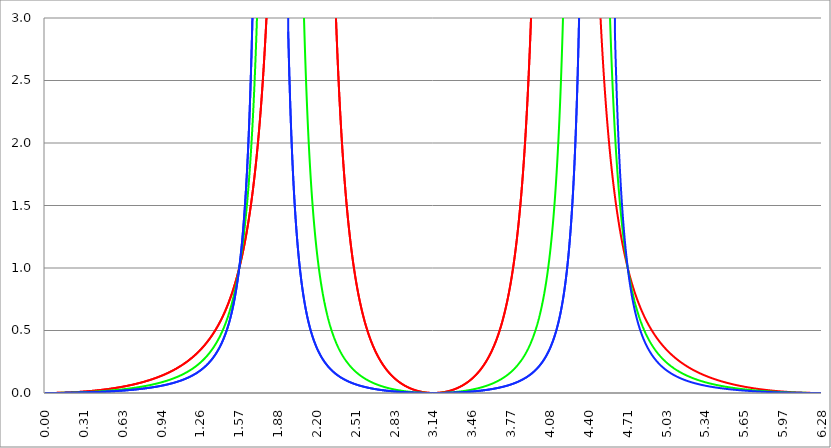
| Category | Series 1 | Series 0 | Series 2 |
|---|---|---|---|
| 0.0 | 0 | 0 | 0 |
| 0.00314159265358979 | 0 | 0 | 0 |
| 0.00628318530717958 | 0 | 0 | 0 |
| 0.00942477796076938 | 0 | 0 | 0 |
| 0.0125663706143592 | 0 | 0 | 0 |
| 0.015707963267949 | 0 | 0 | 0 |
| 0.0188495559215388 | 0 | 0 | 0 |
| 0.0219911485751285 | 0 | 0 | 0 |
| 0.0251327412287183 | 0 | 0 | 0 |
| 0.0282743338823081 | 0 | 0 | 0 |
| 0.0314159265358979 | 0 | 0 | 0 |
| 0.0345575191894877 | 0 | 0 | 0 |
| 0.0376991118430775 | 0 | 0 | 0 |
| 0.0408407044966673 | 0 | 0 | 0 |
| 0.0439822971502571 | 0 | 0 | 0 |
| 0.0471238898038469 | 0 | 0 | 0 |
| 0.0502654824574367 | 0 | 0 | 0 |
| 0.0534070751110265 | 0 | 0 | 0 |
| 0.0565486677646163 | 0 | 0 | 0 |
| 0.059690260418206 | 0 | 0 | 0 |
| 0.0628318530717958 | 0 | 0 | 0 |
| 0.0659734457253856 | 0 | 0 | 0 |
| 0.0691150383789754 | 0.001 | 0 | 0 |
| 0.0722566310325652 | 0.001 | 0 | 0 |
| 0.075398223686155 | 0.001 | 0 | 0 |
| 0.0785398163397448 | 0.001 | 0 | 0 |
| 0.0816814089933346 | 0.001 | 0 | 0 |
| 0.0848230016469244 | 0.001 | 0 | 0 |
| 0.0879645943005142 | 0.001 | 0 | 0 |
| 0.091106186954104 | 0.001 | 0.001 | 0 |
| 0.0942477796076937 | 0.001 | 0.001 | 0 |
| 0.0973893722612835 | 0.001 | 0.001 | 0 |
| 0.100530964914873 | 0.001 | 0.001 | 0 |
| 0.103672557568463 | 0.001 | 0.001 | 0 |
| 0.106814150222053 | 0.001 | 0.001 | 0 |
| 0.109955742875643 | 0.001 | 0.001 | 0 |
| 0.113097335529233 | 0.001 | 0.001 | 0.001 |
| 0.116238928182822 | 0.002 | 0.001 | 0.001 |
| 0.119380520836412 | 0.002 | 0.001 | 0.001 |
| 0.122522113490002 | 0.002 | 0.001 | 0.001 |
| 0.125663706143592 | 0.002 | 0.001 | 0.001 |
| 0.128805298797181 | 0.002 | 0.001 | 0.001 |
| 0.131946891450771 | 0.002 | 0.001 | 0.001 |
| 0.135088484104361 | 0.002 | 0.001 | 0.001 |
| 0.138230076757951 | 0.002 | 0.001 | 0.001 |
| 0.141371669411541 | 0.002 | 0.001 | 0.001 |
| 0.14451326206513 | 0.002 | 0.001 | 0.001 |
| 0.14765485471872 | 0.002 | 0.001 | 0.001 |
| 0.15079644737231 | 0.003 | 0.001 | 0.001 |
| 0.1539380400259 | 0.003 | 0.001 | 0.001 |
| 0.15707963267949 | 0.003 | 0.002 | 0.001 |
| 0.160221225333079 | 0.003 | 0.002 | 0.001 |
| 0.163362817986669 | 0.003 | 0.002 | 0.001 |
| 0.166504410640259 | 0.003 | 0.002 | 0.001 |
| 0.169646003293849 | 0.003 | 0.002 | 0.001 |
| 0.172787595947439 | 0.003 | 0.002 | 0.001 |
| 0.175929188601028 | 0.003 | 0.002 | 0.001 |
| 0.179070781254618 | 0.004 | 0.002 | 0.001 |
| 0.182212373908208 | 0.004 | 0.002 | 0.001 |
| 0.185353966561798 | 0.004 | 0.002 | 0.001 |
| 0.188495559215388 | 0.004 | 0.002 | 0.001 |
| 0.191637151868977 | 0.004 | 0.002 | 0.001 |
| 0.194778744522567 | 0.004 | 0.002 | 0.002 |
| 0.197920337176157 | 0.004 | 0.002 | 0.002 |
| 0.201061929829747 | 0.005 | 0.003 | 0.002 |
| 0.204203522483336 | 0.005 | 0.003 | 0.002 |
| 0.207345115136926 | 0.005 | 0.003 | 0.002 |
| 0.210486707790516 | 0.005 | 0.003 | 0.002 |
| 0.213628300444106 | 0.005 | 0.003 | 0.002 |
| 0.216769893097696 | 0.005 | 0.003 | 0.002 |
| 0.219911485751285 | 0.005 | 0.003 | 0.002 |
| 0.223053078404875 | 0.006 | 0.003 | 0.002 |
| 0.226194671058465 | 0.006 | 0.003 | 0.002 |
| 0.229336263712055 | 0.006 | 0.003 | 0.002 |
| 0.232477856365645 | 0.006 | 0.003 | 0.002 |
| 0.235619449019234 | 0.006 | 0.004 | 0.002 |
| 0.238761041672824 | 0.006 | 0.004 | 0.002 |
| 0.241902634326414 | 0.007 | 0.004 | 0.002 |
| 0.245044226980004 | 0.007 | 0.004 | 0.002 |
| 0.248185819633594 | 0.007 | 0.004 | 0.003 |
| 0.251327412287183 | 0.007 | 0.004 | 0.003 |
| 0.254469004940773 | 0.007 | 0.004 | 0.003 |
| 0.257610597594363 | 0.008 | 0.004 | 0.003 |
| 0.260752190247953 | 0.008 | 0.004 | 0.003 |
| 0.263893782901543 | 0.008 | 0.004 | 0.003 |
| 0.267035375555132 | 0.008 | 0.005 | 0.003 |
| 0.270176968208722 | 0.008 | 0.005 | 0.003 |
| 0.273318560862312 | 0.009 | 0.005 | 0.003 |
| 0.276460153515902 | 0.009 | 0.005 | 0.003 |
| 0.279601746169492 | 0.009 | 0.005 | 0.003 |
| 0.282743338823082 | 0.009 | 0.005 | 0.003 |
| 0.285884931476671 | 0.009 | 0.005 | 0.003 |
| 0.289026524130261 | 0.01 | 0.005 | 0.003 |
| 0.292168116783851 | 0.01 | 0.006 | 0.004 |
| 0.295309709437441 | 0.01 | 0.006 | 0.004 |
| 0.298451302091031 | 0.01 | 0.006 | 0.004 |
| 0.30159289474462 | 0.01 | 0.006 | 0.004 |
| 0.30473448739821 | 0.011 | 0.006 | 0.004 |
| 0.3078760800518 | 0.011 | 0.006 | 0.004 |
| 0.31101767270539 | 0.011 | 0.006 | 0.004 |
| 0.31415926535898 | 0.011 | 0.006 | 0.004 |
| 0.31730085801257 | 0.012 | 0.007 | 0.004 |
| 0.320442450666159 | 0.012 | 0.007 | 0.004 |
| 0.323584043319749 | 0.012 | 0.007 | 0.004 |
| 0.326725635973339 | 0.012 | 0.007 | 0.004 |
| 0.329867228626929 | 0.013 | 0.007 | 0.005 |
| 0.333008821280519 | 0.013 | 0.007 | 0.005 |
| 0.336150413934108 | 0.013 | 0.007 | 0.005 |
| 0.339292006587698 | 0.013 | 0.008 | 0.005 |
| 0.342433599241288 | 0.014 | 0.008 | 0.005 |
| 0.345575191894878 | 0.014 | 0.008 | 0.005 |
| 0.348716784548468 | 0.014 | 0.008 | 0.005 |
| 0.351858377202058 | 0.014 | 0.008 | 0.005 |
| 0.354999969855647 | 0.015 | 0.008 | 0.005 |
| 0.358141562509237 | 0.015 | 0.008 | 0.005 |
| 0.361283155162827 | 0.015 | 0.009 | 0.006 |
| 0.364424747816417 | 0.015 | 0.009 | 0.006 |
| 0.367566340470007 | 0.016 | 0.009 | 0.006 |
| 0.370707933123597 | 0.016 | 0.009 | 0.006 |
| 0.373849525777186 | 0.016 | 0.009 | 0.006 |
| 0.376991118430776 | 0.017 | 0.009 | 0.006 |
| 0.380132711084366 | 0.017 | 0.01 | 0.006 |
| 0.383274303737956 | 0.017 | 0.01 | 0.006 |
| 0.386415896391546 | 0.017 | 0.01 | 0.006 |
| 0.389557489045135 | 0.018 | 0.01 | 0.007 |
| 0.392699081698725 | 0.018 | 0.01 | 0.007 |
| 0.395840674352315 | 0.018 | 0.01 | 0.007 |
| 0.398982267005905 | 0.019 | 0.011 | 0.007 |
| 0.402123859659495 | 0.019 | 0.011 | 0.007 |
| 0.405265452313085 | 0.019 | 0.011 | 0.007 |
| 0.408407044966674 | 0.02 | 0.011 | 0.007 |
| 0.411548637620264 | 0.02 | 0.011 | 0.007 |
| 0.414690230273854 | 0.02 | 0.012 | 0.007 |
| 0.417831822927444 | 0.021 | 0.012 | 0.008 |
| 0.420973415581034 | 0.021 | 0.012 | 0.008 |
| 0.424115008234623 | 0.021 | 0.012 | 0.008 |
| 0.427256600888213 | 0.022 | 0.012 | 0.008 |
| 0.430398193541803 | 0.022 | 0.013 | 0.008 |
| 0.433539786195393 | 0.022 | 0.013 | 0.008 |
| 0.436681378848983 | 0.023 | 0.013 | 0.008 |
| 0.439822971502573 | 0.023 | 0.013 | 0.008 |
| 0.442964564156162 | 0.023 | 0.013 | 0.009 |
| 0.446106156809752 | 0.024 | 0.014 | 0.009 |
| 0.449247749463342 | 0.024 | 0.014 | 0.009 |
| 0.452389342116932 | 0.024 | 0.014 | 0.009 |
| 0.455530934770522 | 0.025 | 0.014 | 0.009 |
| 0.458672527424111 | 0.025 | 0.014 | 0.009 |
| 0.461814120077701 | 0.025 | 0.015 | 0.009 |
| 0.464955712731291 | 0.026 | 0.015 | 0.01 |
| 0.468097305384881 | 0.026 | 0.015 | 0.01 |
| 0.471238898038471 | 0.027 | 0.015 | 0.01 |
| 0.474380490692061 | 0.027 | 0.016 | 0.01 |
| 0.47752208334565 | 0.027 | 0.016 | 0.01 |
| 0.48066367599924 | 0.028 | 0.016 | 0.01 |
| 0.48380526865283 | 0.028 | 0.016 | 0.01 |
| 0.48694686130642 | 0.029 | 0.016 | 0.011 |
| 0.49008845396001 | 0.029 | 0.017 | 0.011 |
| 0.493230046613599 | 0.029 | 0.017 | 0.011 |
| 0.496371639267189 | 0.03 | 0.017 | 0.011 |
| 0.499513231920779 | 0.03 | 0.017 | 0.011 |
| 0.502654824574369 | 0.031 | 0.018 | 0.011 |
| 0.505796417227959 | 0.031 | 0.018 | 0.012 |
| 0.508938009881549 | 0.031 | 0.018 | 0.012 |
| 0.512079602535138 | 0.032 | 0.018 | 0.012 |
| 0.515221195188728 | 0.032 | 0.019 | 0.012 |
| 0.518362787842318 | 0.033 | 0.019 | 0.012 |
| 0.521504380495908 | 0.033 | 0.019 | 0.012 |
| 0.524645973149498 | 0.034 | 0.019 | 0.013 |
| 0.527787565803087 | 0.034 | 0.02 | 0.013 |
| 0.530929158456677 | 0.035 | 0.02 | 0.013 |
| 0.534070751110267 | 0.035 | 0.02 | 0.013 |
| 0.537212343763857 | 0.035 | 0.02 | 0.013 |
| 0.540353936417447 | 0.036 | 0.021 | 0.013 |
| 0.543495529071037 | 0.036 | 0.021 | 0.014 |
| 0.546637121724626 | 0.037 | 0.021 | 0.014 |
| 0.549778714378216 | 0.037 | 0.022 | 0.014 |
| 0.552920307031806 | 0.038 | 0.022 | 0.014 |
| 0.556061899685396 | 0.038 | 0.022 | 0.014 |
| 0.559203492338986 | 0.039 | 0.022 | 0.015 |
| 0.562345084992576 | 0.039 | 0.023 | 0.015 |
| 0.565486677646165 | 0.04 | 0.023 | 0.015 |
| 0.568628270299755 | 0.04 | 0.023 | 0.015 |
| 0.571769862953345 | 0.041 | 0.024 | 0.015 |
| 0.574911455606935 | 0.041 | 0.024 | 0.016 |
| 0.578053048260525 | 0.042 | 0.024 | 0.016 |
| 0.581194640914114 | 0.042 | 0.025 | 0.016 |
| 0.584336233567704 | 0.043 | 0.025 | 0.016 |
| 0.587477826221294 | 0.043 | 0.025 | 0.016 |
| 0.590619418874884 | 0.044 | 0.025 | 0.017 |
| 0.593761011528474 | 0.044 | 0.026 | 0.017 |
| 0.596902604182064 | 0.045 | 0.026 | 0.017 |
| 0.600044196835653 | 0.045 | 0.026 | 0.017 |
| 0.603185789489243 | 0.046 | 0.027 | 0.017 |
| 0.606327382142833 | 0.046 | 0.027 | 0.018 |
| 0.609468974796423 | 0.047 | 0.027 | 0.018 |
| 0.612610567450013 | 0.048 | 0.028 | 0.018 |
| 0.615752160103602 | 0.048 | 0.028 | 0.018 |
| 0.618893752757192 | 0.049 | 0.028 | 0.019 |
| 0.622035345410782 | 0.049 | 0.029 | 0.019 |
| 0.625176938064372 | 0.05 | 0.029 | 0.019 |
| 0.628318530717962 | 0.05 | 0.029 | 0.019 |
| 0.631460123371551 | 0.051 | 0.03 | 0.019 |
| 0.634601716025141 | 0.052 | 0.03 | 0.02 |
| 0.637743308678731 | 0.052 | 0.03 | 0.02 |
| 0.640884901332321 | 0.053 | 0.031 | 0.02 |
| 0.644026493985911 | 0.053 | 0.031 | 0.02 |
| 0.647168086639501 | 0.054 | 0.032 | 0.021 |
| 0.65030967929309 | 0.055 | 0.032 | 0.021 |
| 0.65345127194668 | 0.055 | 0.032 | 0.021 |
| 0.65659286460027 | 0.056 | 0.033 | 0.021 |
| 0.65973445725386 | 0.056 | 0.033 | 0.022 |
| 0.66287604990745 | 0.057 | 0.033 | 0.022 |
| 0.666017642561039 | 0.058 | 0.034 | 0.022 |
| 0.669159235214629 | 0.058 | 0.034 | 0.022 |
| 0.672300827868219 | 0.059 | 0.035 | 0.023 |
| 0.675442420521809 | 0.06 | 0.035 | 0.023 |
| 0.678584013175399 | 0.06 | 0.035 | 0.023 |
| 0.681725605828989 | 0.061 | 0.036 | 0.024 |
| 0.684867198482578 | 0.062 | 0.036 | 0.024 |
| 0.688008791136168 | 0.062 | 0.037 | 0.024 |
| 0.691150383789758 | 0.063 | 0.037 | 0.024 |
| 0.694291976443348 | 0.064 | 0.037 | 0.025 |
| 0.697433569096938 | 0.064 | 0.038 | 0.025 |
| 0.700575161750528 | 0.065 | 0.038 | 0.025 |
| 0.703716754404117 | 0.066 | 0.039 | 0.026 |
| 0.706858347057707 | 0.066 | 0.039 | 0.026 |
| 0.709999939711297 | 0.067 | 0.04 | 0.026 |
| 0.713141532364887 | 0.068 | 0.04 | 0.026 |
| 0.716283125018477 | 0.069 | 0.04 | 0.027 |
| 0.719424717672066 | 0.069 | 0.041 | 0.027 |
| 0.722566310325656 | 0.07 | 0.041 | 0.027 |
| 0.725707902979246 | 0.071 | 0.042 | 0.028 |
| 0.728849495632836 | 0.071 | 0.042 | 0.028 |
| 0.731991088286426 | 0.072 | 0.043 | 0.028 |
| 0.735132680940016 | 0.073 | 0.043 | 0.029 |
| 0.738274273593605 | 0.074 | 0.044 | 0.029 |
| 0.741415866247195 | 0.074 | 0.044 | 0.029 |
| 0.744557458900785 | 0.075 | 0.045 | 0.03 |
| 0.747699051554375 | 0.076 | 0.045 | 0.03 |
| 0.750840644207965 | 0.077 | 0.046 | 0.03 |
| 0.753982236861554 | 0.078 | 0.046 | 0.031 |
| 0.757123829515144 | 0.078 | 0.047 | 0.031 |
| 0.760265422168734 | 0.079 | 0.047 | 0.031 |
| 0.763407014822324 | 0.08 | 0.048 | 0.032 |
| 0.766548607475914 | 0.081 | 0.048 | 0.032 |
| 0.769690200129504 | 0.082 | 0.049 | 0.032 |
| 0.772831792783093 | 0.082 | 0.049 | 0.033 |
| 0.775973385436683 | 0.083 | 0.05 | 0.033 |
| 0.779114978090273 | 0.084 | 0.05 | 0.033 |
| 0.782256570743863 | 0.085 | 0.051 | 0.034 |
| 0.785398163397453 | 0.086 | 0.051 | 0.034 |
| 0.788539756051042 | 0.087 | 0.052 | 0.034 |
| 0.791681348704632 | 0.088 | 0.052 | 0.035 |
| 0.794822941358222 | 0.088 | 0.053 | 0.035 |
| 0.797964534011812 | 0.089 | 0.054 | 0.036 |
| 0.801106126665402 | 0.09 | 0.054 | 0.036 |
| 0.804247719318992 | 0.091 | 0.055 | 0.036 |
| 0.807389311972581 | 0.092 | 0.055 | 0.037 |
| 0.810530904626171 | 0.093 | 0.056 | 0.037 |
| 0.813672497279761 | 0.094 | 0.056 | 0.038 |
| 0.816814089933351 | 0.095 | 0.057 | 0.038 |
| 0.819955682586941 | 0.096 | 0.058 | 0.038 |
| 0.823097275240531 | 0.097 | 0.058 | 0.039 |
| 0.82623886789412 | 0.097 | 0.059 | 0.039 |
| 0.82938046054771 | 0.098 | 0.059 | 0.04 |
| 0.8325220532013 | 0.099 | 0.06 | 0.04 |
| 0.83566364585489 | 0.1 | 0.061 | 0.041 |
| 0.83880523850848 | 0.101 | 0.061 | 0.041 |
| 0.841946831162069 | 0.102 | 0.062 | 0.041 |
| 0.845088423815659 | 0.103 | 0.063 | 0.042 |
| 0.848230016469249 | 0.104 | 0.063 | 0.042 |
| 0.851371609122839 | 0.105 | 0.064 | 0.043 |
| 0.854513201776429 | 0.106 | 0.065 | 0.043 |
| 0.857654794430019 | 0.107 | 0.065 | 0.044 |
| 0.860796387083608 | 0.108 | 0.066 | 0.044 |
| 0.863937979737198 | 0.109 | 0.067 | 0.045 |
| 0.867079572390788 | 0.11 | 0.067 | 0.045 |
| 0.870221165044378 | 0.112 | 0.068 | 0.046 |
| 0.873362757697968 | 0.113 | 0.069 | 0.046 |
| 0.876504350351557 | 0.114 | 0.069 | 0.047 |
| 0.879645943005147 | 0.115 | 0.07 | 0.047 |
| 0.882787535658737 | 0.116 | 0.071 | 0.048 |
| 0.885929128312327 | 0.117 | 0.071 | 0.048 |
| 0.889070720965917 | 0.118 | 0.072 | 0.049 |
| 0.892212313619507 | 0.119 | 0.073 | 0.049 |
| 0.895353906273096 | 0.12 | 0.074 | 0.05 |
| 0.898495498926686 | 0.121 | 0.074 | 0.05 |
| 0.901637091580276 | 0.123 | 0.075 | 0.051 |
| 0.904778684233866 | 0.124 | 0.076 | 0.051 |
| 0.907920276887456 | 0.125 | 0.077 | 0.052 |
| 0.911061869541045 | 0.126 | 0.077 | 0.052 |
| 0.914203462194635 | 0.127 | 0.078 | 0.053 |
| 0.917345054848225 | 0.128 | 0.079 | 0.054 |
| 0.920486647501815 | 0.13 | 0.08 | 0.054 |
| 0.923628240155405 | 0.131 | 0.081 | 0.055 |
| 0.926769832808995 | 0.132 | 0.081 | 0.055 |
| 0.929911425462584 | 0.133 | 0.082 | 0.056 |
| 0.933053018116174 | 0.134 | 0.083 | 0.056 |
| 0.936194610769764 | 0.136 | 0.084 | 0.057 |
| 0.939336203423354 | 0.137 | 0.085 | 0.058 |
| 0.942477796076944 | 0.138 | 0.086 | 0.058 |
| 0.945619388730533 | 0.14 | 0.087 | 0.059 |
| 0.948760981384123 | 0.141 | 0.087 | 0.06 |
| 0.951902574037713 | 0.142 | 0.088 | 0.06 |
| 0.955044166691303 | 0.143 | 0.089 | 0.061 |
| 0.958185759344893 | 0.145 | 0.09 | 0.061 |
| 0.961327351998483 | 0.146 | 0.091 | 0.062 |
| 0.964468944652072 | 0.147 | 0.092 | 0.063 |
| 0.967610537305662 | 0.149 | 0.093 | 0.063 |
| 0.970752129959252 | 0.15 | 0.094 | 0.064 |
| 0.973893722612842 | 0.152 | 0.095 | 0.065 |
| 0.977035315266432 | 0.153 | 0.096 | 0.066 |
| 0.980176907920022 | 0.154 | 0.097 | 0.066 |
| 0.983318500573611 | 0.156 | 0.098 | 0.067 |
| 0.986460093227201 | 0.157 | 0.099 | 0.068 |
| 0.989601685880791 | 0.159 | 0.1 | 0.068 |
| 0.992743278534381 | 0.16 | 0.101 | 0.069 |
| 0.995884871187971 | 0.162 | 0.102 | 0.07 |
| 0.99902646384156 | 0.163 | 0.103 | 0.071 |
| 1.00216805649515 | 0.165 | 0.104 | 0.071 |
| 1.00530964914874 | 0.166 | 0.105 | 0.072 |
| 1.00845124180233 | 0.168 | 0.106 | 0.073 |
| 1.01159283445592 | 0.169 | 0.107 | 0.074 |
| 1.01473442710951 | 0.171 | 0.108 | 0.075 |
| 1.017876019763099 | 0.172 | 0.109 | 0.075 |
| 1.021017612416689 | 0.174 | 0.11 | 0.076 |
| 1.02415920507028 | 0.175 | 0.111 | 0.077 |
| 1.027300797723869 | 0.177 | 0.113 | 0.078 |
| 1.030442390377459 | 0.179 | 0.114 | 0.079 |
| 1.033583983031048 | 0.18 | 0.115 | 0.08 |
| 1.036725575684638 | 0.182 | 0.116 | 0.08 |
| 1.039867168338228 | 0.184 | 0.117 | 0.081 |
| 1.043008760991818 | 0.185 | 0.118 | 0.082 |
| 1.046150353645408 | 0.187 | 0.12 | 0.083 |
| 1.049291946298998 | 0.189 | 0.121 | 0.084 |
| 1.052433538952587 | 0.19 | 0.122 | 0.085 |
| 1.055575131606177 | 0.192 | 0.123 | 0.086 |
| 1.058716724259767 | 0.194 | 0.125 | 0.087 |
| 1.061858316913357 | 0.196 | 0.126 | 0.088 |
| 1.064999909566947 | 0.197 | 0.127 | 0.089 |
| 1.068141502220536 | 0.199 | 0.128 | 0.09 |
| 1.071283094874126 | 0.201 | 0.13 | 0.091 |
| 1.074424687527716 | 0.203 | 0.131 | 0.092 |
| 1.077566280181306 | 0.205 | 0.132 | 0.093 |
| 1.080707872834896 | 0.207 | 0.134 | 0.094 |
| 1.083849465488486 | 0.208 | 0.135 | 0.095 |
| 1.086991058142075 | 0.21 | 0.137 | 0.096 |
| 1.090132650795665 | 0.212 | 0.138 | 0.097 |
| 1.093274243449255 | 0.214 | 0.139 | 0.098 |
| 1.096415836102845 | 0.216 | 0.141 | 0.099 |
| 1.099557428756435 | 0.218 | 0.142 | 0.1 |
| 1.102699021410025 | 0.22 | 0.144 | 0.101 |
| 1.105840614063614 | 0.222 | 0.145 | 0.102 |
| 1.108982206717204 | 0.224 | 0.147 | 0.104 |
| 1.112123799370794 | 0.226 | 0.148 | 0.105 |
| 1.115265392024384 | 0.228 | 0.15 | 0.106 |
| 1.118406984677974 | 0.23 | 0.151 | 0.107 |
| 1.121548577331563 | 0.232 | 0.153 | 0.108 |
| 1.124690169985153 | 0.235 | 0.155 | 0.11 |
| 1.127831762638743 | 0.237 | 0.156 | 0.111 |
| 1.130973355292333 | 0.239 | 0.158 | 0.112 |
| 1.134114947945923 | 0.241 | 0.16 | 0.113 |
| 1.137256540599513 | 0.243 | 0.161 | 0.115 |
| 1.140398133253102 | 0.245 | 0.163 | 0.116 |
| 1.143539725906692 | 0.248 | 0.165 | 0.117 |
| 1.146681318560282 | 0.25 | 0.166 | 0.119 |
| 1.149822911213872 | 0.252 | 0.168 | 0.12 |
| 1.152964503867462 | 0.255 | 0.17 | 0.121 |
| 1.156106096521051 | 0.257 | 0.172 | 0.123 |
| 1.159247689174641 | 0.259 | 0.174 | 0.124 |
| 1.162389281828231 | 0.262 | 0.175 | 0.126 |
| 1.165530874481821 | 0.264 | 0.177 | 0.127 |
| 1.168672467135411 | 0.266 | 0.179 | 0.129 |
| 1.171814059789001 | 0.269 | 0.181 | 0.13 |
| 1.17495565244259 | 0.271 | 0.183 | 0.132 |
| 1.17809724509618 | 0.274 | 0.185 | 0.133 |
| 1.18123883774977 | 0.276 | 0.187 | 0.135 |
| 1.18438043040336 | 0.279 | 0.189 | 0.136 |
| 1.18752202305695 | 0.282 | 0.191 | 0.138 |
| 1.190663615710539 | 0.284 | 0.193 | 0.14 |
| 1.193805208364129 | 0.287 | 0.195 | 0.141 |
| 1.19694680101772 | 0.289 | 0.197 | 0.143 |
| 1.200088393671309 | 0.292 | 0.199 | 0.145 |
| 1.203229986324899 | 0.295 | 0.202 | 0.147 |
| 1.206371578978489 | 0.298 | 0.204 | 0.148 |
| 1.209513171632078 | 0.3 | 0.206 | 0.15 |
| 1.212654764285668 | 0.303 | 0.208 | 0.152 |
| 1.215796356939258 | 0.306 | 0.211 | 0.154 |
| 1.218937949592848 | 0.309 | 0.213 | 0.156 |
| 1.222079542246438 | 0.312 | 0.215 | 0.158 |
| 1.225221134900027 | 0.315 | 0.218 | 0.16 |
| 1.228362727553617 | 0.318 | 0.22 | 0.162 |
| 1.231504320207207 | 0.321 | 0.223 | 0.164 |
| 1.234645912860797 | 0.324 | 0.225 | 0.166 |
| 1.237787505514387 | 0.327 | 0.228 | 0.168 |
| 1.240929098167977 | 0.33 | 0.23 | 0.17 |
| 1.244070690821566 | 0.333 | 0.233 | 0.172 |
| 1.247212283475156 | 0.336 | 0.235 | 0.174 |
| 1.250353876128746 | 0.339 | 0.238 | 0.176 |
| 1.253495468782336 | 0.342 | 0.241 | 0.179 |
| 1.256637061435926 | 0.345 | 0.244 | 0.181 |
| 1.259778654089515 | 0.349 | 0.246 | 0.183 |
| 1.262920246743105 | 0.352 | 0.249 | 0.186 |
| 1.266061839396695 | 0.355 | 0.252 | 0.188 |
| 1.269203432050285 | 0.359 | 0.255 | 0.19 |
| 1.272345024703875 | 0.362 | 0.258 | 0.193 |
| 1.275486617357465 | 0.366 | 0.261 | 0.195 |
| 1.278628210011054 | 0.369 | 0.264 | 0.198 |
| 1.281769802664644 | 0.373 | 0.267 | 0.201 |
| 1.284911395318234 | 0.376 | 0.27 | 0.203 |
| 1.288052987971824 | 0.38 | 0.273 | 0.206 |
| 1.291194580625414 | 0.384 | 0.276 | 0.209 |
| 1.294336173279003 | 0.387 | 0.28 | 0.212 |
| 1.297477765932593 | 0.391 | 0.283 | 0.214 |
| 1.300619358586183 | 0.395 | 0.286 | 0.217 |
| 1.303760951239773 | 0.399 | 0.29 | 0.22 |
| 1.306902543893363 | 0.402 | 0.293 | 0.223 |
| 1.310044136546953 | 0.406 | 0.297 | 0.226 |
| 1.313185729200542 | 0.41 | 0.3 | 0.229 |
| 1.316327321854132 | 0.414 | 0.304 | 0.233 |
| 1.319468914507722 | 0.418 | 0.308 | 0.236 |
| 1.322610507161312 | 0.423 | 0.311 | 0.239 |
| 1.325752099814902 | 0.427 | 0.315 | 0.242 |
| 1.328893692468491 | 0.431 | 0.319 | 0.246 |
| 1.332035285122081 | 0.435 | 0.323 | 0.249 |
| 1.335176877775671 | 0.439 | 0.327 | 0.253 |
| 1.338318470429261 | 0.444 | 0.331 | 0.256 |
| 1.341460063082851 | 0.448 | 0.335 | 0.26 |
| 1.344601655736441 | 0.453 | 0.339 | 0.264 |
| 1.34774324839003 | 0.457 | 0.344 | 0.268 |
| 1.35088484104362 | 0.462 | 0.348 | 0.272 |
| 1.35402643369721 | 0.466 | 0.352 | 0.276 |
| 1.3571680263508 | 0.471 | 0.357 | 0.28 |
| 1.36030961900439 | 0.476 | 0.361 | 0.284 |
| 1.363451211657979 | 0.48 | 0.366 | 0.288 |
| 1.36659280431157 | 0.485 | 0.371 | 0.292 |
| 1.369734396965159 | 0.49 | 0.375 | 0.297 |
| 1.372875989618749 | 0.495 | 0.38 | 0.301 |
| 1.376017582272339 | 0.5 | 0.385 | 0.306 |
| 1.379159174925929 | 0.505 | 0.39 | 0.31 |
| 1.382300767579518 | 0.511 | 0.395 | 0.315 |
| 1.385442360233108 | 0.516 | 0.401 | 0.32 |
| 1.388583952886698 | 0.521 | 0.406 | 0.325 |
| 1.391725545540288 | 0.526 | 0.411 | 0.33 |
| 1.394867138193878 | 0.532 | 0.417 | 0.335 |
| 1.398008730847468 | 0.537 | 0.422 | 0.341 |
| 1.401150323501057 | 0.543 | 0.428 | 0.346 |
| 1.404291916154647 | 0.549 | 0.434 | 0.352 |
| 1.407433508808237 | 0.554 | 0.44 | 0.357 |
| 1.410575101461827 | 0.56 | 0.446 | 0.363 |
| 1.413716694115417 | 0.566 | 0.452 | 0.369 |
| 1.416858286769006 | 0.572 | 0.458 | 0.375 |
| 1.419999879422596 | 0.578 | 0.464 | 0.381 |
| 1.423141472076186 | 0.584 | 0.471 | 0.388 |
| 1.426283064729776 | 0.59 | 0.478 | 0.394 |
| 1.429424657383366 | 0.597 | 0.484 | 0.401 |
| 1.432566250036956 | 0.603 | 0.491 | 0.408 |
| 1.435707842690545 | 0.609 | 0.498 | 0.415 |
| 1.438849435344135 | 0.616 | 0.505 | 0.422 |
| 1.441991027997725 | 0.623 | 0.512 | 0.429 |
| 1.445132620651315 | 0.629 | 0.52 | 0.437 |
| 1.448274213304905 | 0.636 | 0.527 | 0.444 |
| 1.451415805958494 | 0.643 | 0.535 | 0.452 |
| 1.454557398612084 | 0.65 | 0.543 | 0.46 |
| 1.457698991265674 | 0.657 | 0.551 | 0.469 |
| 1.460840583919264 | 0.664 | 0.559 | 0.477 |
| 1.463982176572854 | 0.672 | 0.568 | 0.486 |
| 1.467123769226444 | 0.679 | 0.576 | 0.495 |
| 1.470265361880033 | 0.687 | 0.585 | 0.504 |
| 1.473406954533623 | 0.694 | 0.594 | 0.513 |
| 1.476548547187213 | 0.702 | 0.603 | 0.523 |
| 1.479690139840803 | 0.71 | 0.612 | 0.533 |
| 1.482831732494393 | 0.718 | 0.622 | 0.543 |
| 1.485973325147982 | 0.726 | 0.631 | 0.554 |
| 1.489114917801572 | 0.734 | 0.641 | 0.565 |
| 1.492256510455162 | 0.743 | 0.651 | 0.576 |
| 1.495398103108752 | 0.751 | 0.662 | 0.587 |
| 1.498539695762342 | 0.76 | 0.672 | 0.599 |
| 1.501681288415932 | 0.768 | 0.683 | 0.611 |
| 1.504822881069521 | 0.777 | 0.694 | 0.623 |
| 1.507964473723111 | 0.786 | 0.705 | 0.636 |
| 1.511106066376701 | 0.795 | 0.717 | 0.649 |
| 1.514247659030291 | 0.805 | 0.729 | 0.663 |
| 1.517389251683881 | 0.814 | 0.741 | 0.677 |
| 1.520530844337471 | 0.824 | 0.753 | 0.692 |
| 1.52367243699106 | 0.833 | 0.766 | 0.706 |
| 1.52681402964465 | 0.843 | 0.779 | 0.722 |
| 1.52995562229824 | 0.853 | 0.792 | 0.738 |
| 1.53309721495183 | 0.863 | 0.806 | 0.754 |
| 1.53623880760542 | 0.874 | 0.82 | 0.771 |
| 1.539380400259009 | 0.884 | 0.834 | 0.788 |
| 1.542521992912599 | 0.895 | 0.849 | 0.806 |
| 1.545663585566189 | 0.906 | 0.864 | 0.825 |
| 1.548805178219779 | 0.917 | 0.88 | 0.844 |
| 1.551946770873369 | 0.928 | 0.896 | 0.864 |
| 1.555088363526959 | 0.94 | 0.912 | 0.885 |
| 1.558229956180548 | 0.951 | 0.929 | 0.906 |
| 1.561371548834138 | 0.963 | 0.946 | 0.929 |
| 1.564513141487728 | 0.975 | 0.963 | 0.952 |
| 1.567654734141318 | 0.988 | 0.981 | 0.975 |
| 1.570796326794908 | 1 | 1 | 1 |
| 1.573937919448497 | 1.013 | 1.019 | 1.026 |
| 1.577079512102087 | 1.026 | 1.039 | 1.052 |
| 1.580221104755677 | 1.039 | 1.059 | 1.08 |
| 1.583362697409267 | 1.052 | 1.08 | 1.108 |
| 1.586504290062857 | 1.066 | 1.101 | 1.138 |
| 1.589645882716447 | 1.079 | 1.123 | 1.169 |
| 1.592787475370036 | 1.094 | 1.146 | 1.202 |
| 1.595929068023626 | 1.108 | 1.169 | 1.235 |
| 1.599070660677216 | 1.123 | 1.193 | 1.27 |
| 1.602212253330806 | 1.137 | 1.218 | 1.307 |
| 1.605353845984396 | 1.153 | 1.243 | 1.345 |
| 1.608495438637985 | 1.168 | 1.269 | 1.385 |
| 1.611637031291575 | 1.184 | 1.296 | 1.426 |
| 1.614778623945165 | 1.2 | 1.324 | 1.47 |
| 1.617920216598755 | 1.216 | 1.353 | 1.515 |
| 1.621061809252345 | 1.233 | 1.383 | 1.562 |
| 1.624203401905935 | 1.25 | 1.414 | 1.612 |
| 1.627344994559524 | 1.267 | 1.445 | 1.664 |
| 1.630486587213114 | 1.285 | 1.478 | 1.719 |
| 1.633628179866704 | 1.303 | 1.512 | 1.776 |
| 1.636769772520294 | 1.321 | 1.547 | 1.837 |
| 1.639911365173884 | 1.34 | 1.583 | 1.9 |
| 1.643052957827473 | 1.359 | 1.621 | 1.967 |
| 1.646194550481063 | 1.378 | 1.66 | 2.037 |
| 1.649336143134653 | 1.398 | 1.7 | 2.111 |
| 1.652477735788243 | 1.419 | 1.742 | 2.189 |
| 1.655619328441833 | 1.439 | 1.785 | 2.272 |
| 1.658760921095423 | 1.46 | 1.83 | 2.359 |
| 1.661902513749012 | 1.482 | 1.876 | 2.451 |
| 1.665044106402602 | 1.504 | 1.924 | 2.549 |
| 1.668185699056192 | 1.527 | 1.974 | 2.653 |
| 1.671327291709782 | 1.55 | 2.027 | 2.763 |
| 1.674468884363372 | 1.573 | 2.081 | 2.88 |
| 1.677610477016961 | 1.597 | 2.137 | 3.005 |
| 1.680752069670551 | 1.622 | 2.196 | 3.138 |
| 1.683893662324141 | 1.647 | 2.257 | 3.281 |
| 1.687035254977731 | 1.672 | 2.32 | 3.433 |
| 1.690176847631321 | 1.699 | 2.387 | 3.596 |
| 1.693318440284911 | 1.726 | 2.456 | 3.77 |
| 1.6964600329385 | 1.753 | 2.528 | 3.958 |
| 1.69960162559209 | 1.781 | 2.603 | 4.16 |
| 1.70274321824568 | 1.81 | 2.682 | 4.379 |
| 1.70588481089927 | 1.839 | 2.764 | 4.614 |
| 1.70902640355286 | 1.869 | 2.851 | 4.87 |
| 1.712167996206449 | 1.9 | 2.941 | 5.147 |
| 1.715309588860039 | 1.932 | 3.036 | 5.448 |
| 1.71845118151363 | 1.964 | 3.135 | 5.777 |
| 1.721592774167219 | 1.997 | 3.239 | 6.137 |
| 1.724734366820809 | 2.031 | 3.349 | 6.531 |
| 1.727875959474399 | 2.066 | 3.464 | 6.964 |
| 1.731017552127988 | 2.102 | 3.585 | 7.443 |
| 1.734159144781578 | 2.138 | 3.713 | 7.972 |
| 1.737300737435168 | 2.176 | 3.847 | 8.561 |
| 1.740442330088758 | 2.215 | 3.989 | 9.217 |
| 1.743583922742348 | 2.254 | 4.139 | 9.951 |
| 1.746725515395937 | 2.295 | 4.298 | 10.777 |
| 1.749867108049527 | 2.336 | 4.466 | 11.711 |
| 1.753008700703117 | 2.379 | 4.643 | 12.773 |
| 1.756150293356707 | 2.423 | 4.832 | 13.985 |
| 1.759291886010297 | 2.468 | 5.033 | 15.38 |
| 1.762433478663887 | 2.515 | 5.246 | 16.994 |
| 1.765575071317476 | 2.562 | 5.473 | 18.878 |
| 1.768716663971066 | 2.611 | 5.716 | 21.095 |
| 1.771858256624656 | 2.662 | 5.975 | 23.727 |
| 1.774999849278246 | 2.714 | 6.252 | 26.886 |
| 1.778141441931836 | 2.767 | 6.548 | 30.723 |
| 1.781283034585426 | 2.822 | 6.867 | 35.446 |
| 1.784424627239015 | 2.879 | 7.209 | 41.353 |
| 1.787566219892605 | 2.937 | 7.578 | 48.873 |
| 1.790707812546195 | 2.997 | 7.975 | 58.655 |
| 1.793849405199785 | 3.059 | 8.405 | 71.705 |
| 1.796990997853375 | 3.123 | 8.871 | 89.663 |
| 1.800132590506964 | 3.189 | 9.377 | 115.34 |
| 1.803274183160554 | 3.257 | 9.928 | 153.891 |
| 1.806415775814144 | 3.327 | 10.529 | 215.627 |
| 1.809557368467734 | 3.399 | 11.187 | 323.706 |
| 1.812698961121324 | 3.474 | 11.908 | 539.519 |
| 1.815840553774914 | 3.551 | 12.702 | 1073.948 |
| 1.818982146428503 | 3.631 | 13.578 | 3097.615 |
| 1.822123739082093 | 3.714 | 14.549 | 34161.462 |
| 1.825265331735683 | 3.799 | 15.629 | 19524.47 |
| 1.828406924389273 | 3.887 | 16.834 | 2567.825 |
| 1.831548517042863 | 3.979 | 18.184 | 957.192 |
| 1.834690109696452 | 4.073 | 19.705 | 495.563 |
| 1.837831702350042 | 4.172 | 21.426 | 302.129 |
| 1.840973295003632 | 4.273 | 23.384 | 203.193 |
| 1.844114887657222 | 4.379 | 25.624 | 145.91 |
| 1.847256480310812 | 4.488 | 28.205 | 109.804 |
| 1.850398072964402 | 4.602 | 31.198 | 85.593 |
| 1.853539665617991 | 4.72 | 34.697 | 68.574 |
| 1.856681258271581 | 4.842 | 38.822 | 56.158 |
| 1.859822850925171 | 4.97 | 43.733 | 46.824 |
| 1.862964443578761 | 5.102 | 49.644 | 39.631 |
| 1.866106036232351 | 5.24 | 56.846 | 33.971 |
| 1.86924762888594 | 5.384 | 65.744 | 29.438 |
| 1.87238922153953 | 5.534 | 76.918 | 25.751 |
| 1.87553081419312 | 5.69 | 91.216 | 22.713 |
| 1.87867240684671 | 5.852 | 109.925 | 20.18 |
| 1.8818139995003 | 6.022 | 135.066 | 18.046 |
| 1.88495559215389 | 6.2 | 169.971 | 16.231 |
| 1.888097184807479 | 6.385 | 220.443 | 14.675 |
| 1.891238777461069 | 6.579 | 297.342 | 13.331 |
| 1.89438037011466 | 6.782 | 422.967 | 12.162 |
| 1.897521962768249 | 6.994 | 649.269 | 11.139 |
| 1.900663555421839 | 7.217 | 1121.742 | 10.239 |
| 1.903805148075429 | 7.451 | 2388.869 | 9.442 |
| 1.906946740729018 | 7.696 | 8186.375 | 8.735 |
| 1.910088333382608 | 7.954 | 374285.39 | 8.103 |
| 1.913229926036198 | 8.225 | 16463.282 | 7.536 |
| 1.916371518689788 | 8.51 | 3367.454 | 7.026 |
| 1.919513111343378 | 8.811 | 1404.605 | 6.566 |
| 1.922654703996967 | 9.128 | 765.506 | 6.149 |
| 1.925796296650557 | 9.462 | 480.595 | 5.77 |
| 1.928937889304147 | 9.816 | 329.392 | 5.424 |
| 1.932079481957737 | 10.189 | 239.667 | 5.108 |
| 1.935221074611327 | 10.585 | 182.113 | 4.818 |
| 1.938362667264917 | 11.005 | 143.008 | 4.552 |
| 1.941504259918506 | 11.45 | 115.238 | 4.307 |
| 1.944645852572096 | 11.924 | 94.813 | 4.081 |
| 1.947787445225686 | 12.427 | 79.355 | 3.872 |
| 1.950929037879276 | 12.964 | 67.376 | 3.678 |
| 1.954070630532866 | 13.536 | 57.907 | 3.499 |
| 1.957212223186455 | 14.148 | 50.292 | 3.331 |
| 1.960353815840045 | 14.803 | 44.078 | 3.176 |
| 1.963495408493635 | 15.504 | 38.941 | 3.03 |
| 1.966637001147225 | 16.258 | 34.647 | 2.894 |
| 1.969778593800815 | 17.068 | 31.021 | 2.767 |
| 1.972920186454405 | 17.942 | 27.931 | 2.648 |
| 1.976061779107994 | 18.885 | 25.277 | 2.536 |
| 1.979203371761584 | 19.905 | 22.981 | 2.431 |
| 1.982344964415174 | 21.012 | 20.981 | 2.332 |
| 1.985486557068764 | 22.214 | 19.229 | 2.239 |
| 1.988628149722354 | 23.524 | 17.684 | 2.151 |
| 1.991769742375943 | 24.955 | 16.317 | 2.068 |
| 1.994911335029533 | 26.523 | 15.1 | 1.99 |
| 1.998052927683123 | 28.244 | 14.013 | 1.916 |
| 2.001194520336712 | 30.141 | 13.037 | 1.846 |
| 2.004336112990302 | 32.238 | 12.158 | 1.779 |
| 2.007477705643892 | 34.565 | 11.364 | 1.716 |
| 2.010619298297482 | 37.155 | 10.644 | 1.656 |
| 2.013760890951071 | 40.052 | 9.989 | 1.599 |
| 2.016902483604661 | 43.306 | 9.392 | 1.545 |
| 2.02004407625825 | 46.977 | 8.846 | 1.493 |
| 2.02318566891184 | 51.141 | 8.345 | 1.444 |
| 2.02632726156543 | 55.89 | 7.885 | 1.397 |
| 2.029468854219019 | 61.341 | 7.46 | 1.352 |
| 2.032610446872609 | 67.639 | 7.069 | 1.31 |
| 2.035752039526198 | 74.969 | 6.707 | 1.269 |
| 2.038893632179788 | 83.57 | 6.371 | 1.23 |
| 2.042035224833378 | 93.758 | 6.059 | 1.192 |
| 2.045176817486967 | 105.946 | 5.769 | 1.157 |
| 2.048318410140557 | 120.699 | 5.499 | 1.122 |
| 2.051460002794146 | 138.791 | 5.247 | 1.09 |
| 2.054601595447736 | 161.315 | 5.011 | 1.058 |
| 2.057743188101325 | 189.85 | 4.79 | 1.028 |
| 2.060884780754915 | 226.749 | 4.583 | 0.999 |
| 2.064026373408505 | 275.638 | 4.389 | 0.971 |
| 2.067167966062094 | 342.351 | 4.207 | 0.944 |
| 2.070309558715684 | 436.755 | 4.035 | 0.918 |
| 2.073451151369273 | 576.636 | 3.873 | 0.894 |
| 2.076592744022863 | 796.753 | 3.721 | 0.87 |
| 2.079734336676452 | 1172.783 | 3.577 | 0.847 |
| 2.082875929330042 | 1896.414 | 3.44 | 0.825 |
| 2.086017521983632 | 3579.114 | 3.312 | 0.803 |
| 2.089159114637221 | 9146.285 | 3.19 | 0.783 |
| 2.092300707290811 | 57061.894 | 3.074 | 0.763 |
| 2.095442299944401 | 227834.643 | 2.964 | 0.744 |
| 2.09858389259799 | 14213.646 | 2.86 | 0.725 |
| 2.10172548525158 | 4632.626 | 2.761 | 0.707 |
| 2.104867077905169 | 2265.756 | 2.666 | 0.69 |
| 2.108008670558759 | 1338.161 | 2.577 | 0.673 |
| 2.111150263212349 | 881.716 | 2.491 | 0.657 |
| 2.114291855865938 | 624.062 | 2.41 | 0.642 |
| 2.117433448519528 | 464.566 | 2.332 | 0.627 |
| 2.120575041173117 | 359.056 | 2.257 | 0.612 |
| 2.123716633826707 | 285.672 | 2.186 | 0.598 |
| 2.126858226480297 | 232.591 | 2.118 | 0.584 |
| 2.129999819133886 | 192.967 | 2.054 | 0.571 |
| 2.133141411787476 | 162.613 | 1.991 | 0.558 |
| 2.136283004441065 | 138.85 | 1.932 | 0.545 |
| 2.139424597094655 | 119.903 | 1.875 | 0.533 |
| 2.142566189748245 | 104.554 | 1.82 | 0.522 |
| 2.145707782401834 | 91.949 | 1.767 | 0.51 |
| 2.148849375055424 | 81.472 | 1.717 | 0.499 |
| 2.151990967709013 | 72.67 | 1.668 | 0.488 |
| 2.155132560362603 | 65.205 | 1.622 | 0.478 |
| 2.158274153016193 | 58.82 | 1.577 | 0.468 |
| 2.161415745669782 | 53.317 | 1.534 | 0.458 |
| 2.164557338323372 | 48.541 | 1.492 | 0.448 |
| 2.167698930976961 | 44.37 | 1.453 | 0.439 |
| 2.170840523630551 | 40.705 | 1.414 | 0.43 |
| 2.173982116284141 | 37.469 | 1.377 | 0.421 |
| 2.17712370893773 | 34.597 | 1.341 | 0.413 |
| 2.18026530159132 | 32.037 | 1.307 | 0.404 |
| 2.183406894244909 | 29.746 | 1.273 | 0.396 |
| 2.186548486898499 | 27.686 | 1.241 | 0.388 |
| 2.189690079552089 | 25.829 | 1.21 | 0.38 |
| 2.192831672205678 | 24.148 | 1.18 | 0.373 |
| 2.195973264859268 | 22.622 | 1.151 | 0.366 |
| 2.199114857512857 | 21.233 | 1.123 | 0.359 |
| 2.202256450166447 | 19.965 | 1.096 | 0.352 |
| 2.205398042820036 | 18.803 | 1.07 | 0.345 |
| 2.208539635473626 | 17.738 | 1.044 | 0.338 |
| 2.211681228127216 | 16.758 | 1.02 | 0.332 |
| 2.214822820780805 | 15.854 | 0.996 | 0.325 |
| 2.217964413434395 | 15.019 | 0.973 | 0.319 |
| 2.221106006087984 | 14.246 | 0.951 | 0.313 |
| 2.224247598741574 | 13.53 | 0.929 | 0.308 |
| 2.227389191395164 | 12.864 | 0.908 | 0.302 |
| 2.230530784048753 | 12.244 | 0.888 | 0.296 |
| 2.233672376702343 | 11.666 | 0.868 | 0.291 |
| 2.236813969355933 | 11.127 | 0.849 | 0.286 |
| 2.239955562009522 | 10.623 | 0.83 | 0.28 |
| 2.243097154663112 | 10.15 | 0.812 | 0.275 |
| 2.246238747316701 | 9.707 | 0.794 | 0.27 |
| 2.249380339970291 | 9.292 | 0.777 | 0.266 |
| 2.252521932623881 | 8.901 | 0.76 | 0.261 |
| 2.25566352527747 | 8.533 | 0.744 | 0.256 |
| 2.25880511793106 | 8.186 | 0.729 | 0.252 |
| 2.261946710584649 | 7.859 | 0.713 | 0.247 |
| 2.265088303238239 | 7.55 | 0.699 | 0.243 |
| 2.268229895891829 | 7.258 | 0.684 | 0.239 |
| 2.271371488545418 | 6.982 | 0.67 | 0.235 |
| 2.274513081199008 | 6.72 | 0.656 | 0.23 |
| 2.277654673852597 | 6.472 | 0.643 | 0.226 |
| 2.280796266506186 | 6.237 | 0.63 | 0.223 |
| 2.283937859159776 | 6.013 | 0.617 | 0.219 |
| 2.287079451813366 | 5.801 | 0.605 | 0.215 |
| 2.290221044466955 | 5.598 | 0.593 | 0.211 |
| 2.293362637120545 | 5.406 | 0.581 | 0.208 |
| 2.296504229774135 | 5.222 | 0.57 | 0.204 |
| 2.299645822427724 | 5.047 | 0.559 | 0.201 |
| 2.302787415081314 | 4.881 | 0.548 | 0.198 |
| 2.305929007734904 | 4.721 | 0.537 | 0.194 |
| 2.309070600388493 | 4.569 | 0.527 | 0.191 |
| 2.312212193042083 | 4.423 | 0.517 | 0.188 |
| 2.315353785695672 | 4.284 | 0.507 | 0.185 |
| 2.318495378349262 | 4.151 | 0.497 | 0.182 |
| 2.321636971002852 | 4.023 | 0.488 | 0.179 |
| 2.324778563656441 | 3.901 | 0.479 | 0.176 |
| 2.327920156310031 | 3.783 | 0.47 | 0.173 |
| 2.33106174896362 | 3.671 | 0.461 | 0.17 |
| 2.33420334161721 | 3.563 | 0.452 | 0.167 |
| 2.3373449342708 | 3.459 | 0.444 | 0.165 |
| 2.340486526924389 | 3.359 | 0.436 | 0.162 |
| 2.343628119577979 | 3.263 | 0.428 | 0.159 |
| 2.346769712231568 | 3.171 | 0.42 | 0.157 |
| 2.349911304885158 | 3.082 | 0.412 | 0.154 |
| 2.353052897538748 | 2.997 | 0.405 | 0.152 |
| 2.356194490192337 | 2.914 | 0.398 | 0.15 |
| 2.359336082845927 | 2.835 | 0.391 | 0.147 |
| 2.362477675499516 | 2.758 | 0.384 | 0.145 |
| 2.365619268153106 | 2.685 | 0.377 | 0.143 |
| 2.368760860806696 | 2.613 | 0.37 | 0.14 |
| 2.371902453460285 | 2.545 | 0.363 | 0.138 |
| 2.375044046113875 | 2.478 | 0.357 | 0.136 |
| 2.378185638767464 | 2.414 | 0.351 | 0.134 |
| 2.381327231421054 | 2.352 | 0.345 | 0.132 |
| 2.384468824074644 | 2.292 | 0.339 | 0.13 |
| 2.387610416728233 | 2.235 | 0.333 | 0.128 |
| 2.390752009381823 | 2.179 | 0.327 | 0.126 |
| 2.393893602035412 | 2.124 | 0.321 | 0.124 |
| 2.397035194689002 | 2.072 | 0.316 | 0.122 |
| 2.400176787342591 | 2.021 | 0.31 | 0.12 |
| 2.403318379996181 | 1.972 | 0.305 | 0.118 |
| 2.406459972649771 | 1.924 | 0.3 | 0.116 |
| 2.40960156530336 | 1.878 | 0.295 | 0.114 |
| 2.41274315795695 | 1.833 | 0.289 | 0.113 |
| 2.41588475061054 | 1.79 | 0.285 | 0.111 |
| 2.419026343264129 | 1.748 | 0.28 | 0.109 |
| 2.422167935917719 | 1.707 | 0.275 | 0.108 |
| 2.425309528571308 | 1.667 | 0.27 | 0.106 |
| 2.428451121224898 | 1.629 | 0.266 | 0.104 |
| 2.431592713878488 | 1.591 | 0.261 | 0.103 |
| 2.434734306532077 | 1.555 | 0.257 | 0.101 |
| 2.437875899185667 | 1.52 | 0.253 | 0.1 |
| 2.441017491839256 | 1.485 | 0.248 | 0.098 |
| 2.444159084492846 | 1.452 | 0.244 | 0.097 |
| 2.447300677146435 | 1.42 | 0.24 | 0.095 |
| 2.450442269800025 | 1.388 | 0.236 | 0.094 |
| 2.453583862453615 | 1.357 | 0.232 | 0.092 |
| 2.456725455107204 | 1.328 | 0.228 | 0.091 |
| 2.459867047760794 | 1.299 | 0.225 | 0.09 |
| 2.463008640414384 | 1.27 | 0.221 | 0.088 |
| 2.466150233067973 | 1.243 | 0.217 | 0.087 |
| 2.469291825721563 | 1.216 | 0.214 | 0.086 |
| 2.472433418375152 | 1.19 | 0.21 | 0.084 |
| 2.475575011028742 | 1.164 | 0.207 | 0.083 |
| 2.478716603682332 | 1.14 | 0.203 | 0.082 |
| 2.481858196335921 | 1.115 | 0.2 | 0.08 |
| 2.48499978898951 | 1.092 | 0.197 | 0.079 |
| 2.4881413816431 | 1.069 | 0.194 | 0.078 |
| 2.49128297429669 | 1.047 | 0.19 | 0.077 |
| 2.49442456695028 | 1.025 | 0.187 | 0.076 |
| 2.497566159603869 | 1.004 | 0.184 | 0.075 |
| 2.500707752257458 | 0.983 | 0.181 | 0.073 |
| 2.503849344911048 | 0.962 | 0.178 | 0.072 |
| 2.506990937564638 | 0.943 | 0.175 | 0.071 |
| 2.510132530218228 | 0.923 | 0.172 | 0.07 |
| 2.513274122871817 | 0.905 | 0.17 | 0.069 |
| 2.516415715525407 | 0.886 | 0.167 | 0.068 |
| 2.519557308178996 | 0.868 | 0.164 | 0.067 |
| 2.522698900832586 | 0.851 | 0.162 | 0.066 |
| 2.525840493486176 | 0.833 | 0.159 | 0.065 |
| 2.528982086139765 | 0.817 | 0.156 | 0.064 |
| 2.532123678793355 | 0.8 | 0.154 | 0.063 |
| 2.535265271446944 | 0.784 | 0.151 | 0.062 |
| 2.538406864100534 | 0.769 | 0.149 | 0.061 |
| 2.541548456754124 | 0.753 | 0.146 | 0.06 |
| 2.544690049407713 | 0.738 | 0.144 | 0.059 |
| 2.547831642061302 | 0.724 | 0.142 | 0.058 |
| 2.550973234714892 | 0.709 | 0.139 | 0.057 |
| 2.554114827368482 | 0.695 | 0.137 | 0.057 |
| 2.557256420022072 | 0.682 | 0.135 | 0.056 |
| 2.560398012675661 | 0.668 | 0.133 | 0.055 |
| 2.563539605329251 | 0.655 | 0.13 | 0.054 |
| 2.56668119798284 | 0.642 | 0.128 | 0.053 |
| 2.56982279063643 | 0.63 | 0.126 | 0.052 |
| 2.57296438329002 | 0.617 | 0.124 | 0.052 |
| 2.576105975943609 | 0.605 | 0.122 | 0.051 |
| 2.579247568597199 | 0.594 | 0.12 | 0.05 |
| 2.582389161250788 | 0.582 | 0.118 | 0.049 |
| 2.585530753904377 | 0.571 | 0.116 | 0.048 |
| 2.588672346557967 | 0.56 | 0.114 | 0.048 |
| 2.591813939211557 | 0.549 | 0.112 | 0.047 |
| 2.594955531865147 | 0.538 | 0.111 | 0.046 |
| 2.598097124518736 | 0.528 | 0.109 | 0.046 |
| 2.601238717172326 | 0.518 | 0.107 | 0.045 |
| 2.604380309825915 | 0.508 | 0.105 | 0.044 |
| 2.607521902479505 | 0.498 | 0.104 | 0.043 |
| 2.610663495133095 | 0.488 | 0.102 | 0.043 |
| 2.613805087786684 | 0.479 | 0.1 | 0.042 |
| 2.616946680440274 | 0.47 | 0.098 | 0.041 |
| 2.620088273093863 | 0.46 | 0.097 | 0.041 |
| 2.623229865747452 | 0.452 | 0.095 | 0.04 |
| 2.626371458401042 | 0.443 | 0.094 | 0.039 |
| 2.629513051054632 | 0.434 | 0.092 | 0.039 |
| 2.632654643708222 | 0.426 | 0.09 | 0.038 |
| 2.635796236361811 | 0.418 | 0.089 | 0.038 |
| 2.638937829015401 | 0.41 | 0.087 | 0.037 |
| 2.642079421668991 | 0.402 | 0.086 | 0.036 |
| 2.64522101432258 | 0.394 | 0.085 | 0.036 |
| 2.64836260697617 | 0.386 | 0.083 | 0.035 |
| 2.651504199629759 | 0.379 | 0.082 | 0.035 |
| 2.654645792283349 | 0.372 | 0.08 | 0.034 |
| 2.657787384936938 | 0.364 | 0.079 | 0.034 |
| 2.660928977590528 | 0.357 | 0.078 | 0.033 |
| 2.664070570244118 | 0.351 | 0.076 | 0.032 |
| 2.667212162897707 | 0.344 | 0.075 | 0.032 |
| 2.670353755551297 | 0.337 | 0.074 | 0.031 |
| 2.673495348204887 | 0.33 | 0.072 | 0.031 |
| 2.676636940858476 | 0.324 | 0.071 | 0.03 |
| 2.679778533512066 | 0.318 | 0.07 | 0.03 |
| 2.682920126165655 | 0.312 | 0.069 | 0.029 |
| 2.686061718819245 | 0.305 | 0.067 | 0.029 |
| 2.689203311472835 | 0.299 | 0.066 | 0.028 |
| 2.692344904126424 | 0.294 | 0.065 | 0.028 |
| 2.695486496780014 | 0.288 | 0.064 | 0.027 |
| 2.698628089433603 | 0.282 | 0.063 | 0.027 |
| 2.701769682087193 | 0.277 | 0.062 | 0.026 |
| 2.704911274740782 | 0.271 | 0.061 | 0.026 |
| 2.708052867394372 | 0.266 | 0.059 | 0.026 |
| 2.711194460047962 | 0.26 | 0.058 | 0.025 |
| 2.714336052701551 | 0.255 | 0.057 | 0.025 |
| 2.717477645355141 | 0.25 | 0.056 | 0.024 |
| 2.720619238008731 | 0.245 | 0.055 | 0.024 |
| 2.72376083066232 | 0.24 | 0.054 | 0.023 |
| 2.72690242331591 | 0.235 | 0.053 | 0.023 |
| 2.730044015969499 | 0.231 | 0.052 | 0.023 |
| 2.733185608623089 | 0.226 | 0.051 | 0.022 |
| 2.736327201276678 | 0.221 | 0.05 | 0.022 |
| 2.739468793930268 | 0.217 | 0.049 | 0.021 |
| 2.742610386583858 | 0.212 | 0.048 | 0.021 |
| 2.745751979237447 | 0.208 | 0.048 | 0.021 |
| 2.748893571891036 | 0.204 | 0.047 | 0.02 |
| 2.752035164544627 | 0.2 | 0.046 | 0.02 |
| 2.755176757198216 | 0.195 | 0.045 | 0.019 |
| 2.758318349851806 | 0.191 | 0.044 | 0.019 |
| 2.761459942505395 | 0.187 | 0.043 | 0.019 |
| 2.764601535158985 | 0.183 | 0.042 | 0.018 |
| 2.767743127812574 | 0.18 | 0.041 | 0.018 |
| 2.770884720466164 | 0.176 | 0.041 | 0.018 |
| 2.774026313119754 | 0.172 | 0.04 | 0.017 |
| 2.777167905773343 | 0.168 | 0.039 | 0.017 |
| 2.780309498426932 | 0.165 | 0.038 | 0.017 |
| 2.783451091080522 | 0.161 | 0.038 | 0.016 |
| 2.786592683734112 | 0.158 | 0.037 | 0.016 |
| 2.789734276387701 | 0.154 | 0.036 | 0.016 |
| 2.792875869041291 | 0.151 | 0.035 | 0.015 |
| 2.796017461694881 | 0.148 | 0.035 | 0.015 |
| 2.79915905434847 | 0.144 | 0.034 | 0.015 |
| 2.80230064700206 | 0.141 | 0.033 | 0.014 |
| 2.80544223965565 | 0.138 | 0.032 | 0.014 |
| 2.808583832309239 | 0.135 | 0.032 | 0.014 |
| 2.811725424962829 | 0.132 | 0.031 | 0.014 |
| 2.814867017616419 | 0.129 | 0.03 | 0.013 |
| 2.818008610270008 | 0.126 | 0.03 | 0.013 |
| 2.821150202923598 | 0.123 | 0.029 | 0.013 |
| 2.824291795577187 | 0.12 | 0.028 | 0.012 |
| 2.827433388230777 | 0.117 | 0.028 | 0.012 |
| 2.830574980884366 | 0.115 | 0.027 | 0.012 |
| 2.833716573537956 | 0.112 | 0.027 | 0.012 |
| 2.836858166191546 | 0.109 | 0.026 | 0.011 |
| 2.839999758845135 | 0.107 | 0.025 | 0.011 |
| 2.843141351498725 | 0.104 | 0.025 | 0.011 |
| 2.846282944152314 | 0.102 | 0.024 | 0.011 |
| 2.849424536805904 | 0.099 | 0.024 | 0.01 |
| 2.852566129459494 | 0.097 | 0.023 | 0.01 |
| 2.855707722113083 | 0.094 | 0.023 | 0.01 |
| 2.858849314766673 | 0.092 | 0.022 | 0.01 |
| 2.861990907420262 | 0.09 | 0.021 | 0.009 |
| 2.865132500073852 | 0.087 | 0.021 | 0.009 |
| 2.868274092727442 | 0.085 | 0.02 | 0.009 |
| 2.871415685381031 | 0.083 | 0.02 | 0.009 |
| 2.874557278034621 | 0.081 | 0.019 | 0.009 |
| 2.87769887068821 | 0.079 | 0.019 | 0.008 |
| 2.8808404633418 | 0.076 | 0.018 | 0.008 |
| 2.88398205599539 | 0.074 | 0.018 | 0.008 |
| 2.88712364864898 | 0.072 | 0.017 | 0.008 |
| 2.890265241302569 | 0.07 | 0.017 | 0.007 |
| 2.893406833956158 | 0.068 | 0.017 | 0.007 |
| 2.896548426609748 | 0.067 | 0.016 | 0.007 |
| 2.899690019263338 | 0.065 | 0.016 | 0.007 |
| 2.902831611916927 | 0.063 | 0.015 | 0.007 |
| 2.905973204570517 | 0.061 | 0.015 | 0.007 |
| 2.909114797224106 | 0.059 | 0.014 | 0.006 |
| 2.912256389877696 | 0.058 | 0.014 | 0.006 |
| 2.915397982531286 | 0.056 | 0.014 | 0.006 |
| 2.918539575184875 | 0.054 | 0.013 | 0.006 |
| 2.921681167838465 | 0.053 | 0.013 | 0.006 |
| 2.924822760492054 | 0.051 | 0.012 | 0.005 |
| 2.927964353145644 | 0.049 | 0.012 | 0.005 |
| 2.931105945799234 | 0.048 | 0.012 | 0.005 |
| 2.934247538452823 | 0.046 | 0.011 | 0.005 |
| 2.937389131106413 | 0.045 | 0.011 | 0.005 |
| 2.940530723760002 | 0.043 | 0.011 | 0.005 |
| 2.943672316413592 | 0.042 | 0.01 | 0.005 |
| 2.946813909067182 | 0.04 | 0.01 | 0.004 |
| 2.949955501720771 | 0.039 | 0.01 | 0.004 |
| 2.953097094374361 | 0.038 | 0.009 | 0.004 |
| 2.95623868702795 | 0.036 | 0.009 | 0.004 |
| 2.95938027968154 | 0.035 | 0.009 | 0.004 |
| 2.96252187233513 | 0.034 | 0.008 | 0.004 |
| 2.965663464988719 | 0.033 | 0.008 | 0.004 |
| 2.968805057642309 | 0.031 | 0.008 | 0.003 |
| 2.971946650295898 | 0.03 | 0.007 | 0.003 |
| 2.975088242949488 | 0.029 | 0.007 | 0.003 |
| 2.978229835603078 | 0.028 | 0.007 | 0.003 |
| 2.981371428256667 | 0.027 | 0.007 | 0.003 |
| 2.984513020910257 | 0.026 | 0.006 | 0.003 |
| 2.987654613563846 | 0.025 | 0.006 | 0.003 |
| 2.990796206217436 | 0.024 | 0.006 | 0.003 |
| 2.993937798871025 | 0.023 | 0.006 | 0.002 |
| 2.997079391524615 | 0.022 | 0.005 | 0.002 |
| 3.000220984178205 | 0.021 | 0.005 | 0.002 |
| 3.003362576831794 | 0.02 | 0.005 | 0.002 |
| 3.006504169485384 | 0.019 | 0.005 | 0.002 |
| 3.009645762138974 | 0.018 | 0.004 | 0.002 |
| 3.012787354792563 | 0.017 | 0.004 | 0.002 |
| 3.015928947446153 | 0.016 | 0.004 | 0.002 |
| 3.019070540099742 | 0.015 | 0.004 | 0.002 |
| 3.022212132753332 | 0.015 | 0.004 | 0.002 |
| 3.025353725406922 | 0.014 | 0.003 | 0.002 |
| 3.028495318060511 | 0.013 | 0.003 | 0.001 |
| 3.031636910714101 | 0.012 | 0.003 | 0.001 |
| 3.03477850336769 | 0.012 | 0.003 | 0.001 |
| 3.03792009602128 | 0.011 | 0.003 | 0.001 |
| 3.04106168867487 | 0.01 | 0.003 | 0.001 |
| 3.04420328132846 | 0.01 | 0.002 | 0.001 |
| 3.047344873982049 | 0.009 | 0.002 | 0.001 |
| 3.050486466635638 | 0.008 | 0.002 | 0.001 |
| 3.053628059289228 | 0.008 | 0.002 | 0.001 |
| 3.056769651942818 | 0.007 | 0.002 | 0.001 |
| 3.059911244596407 | 0.007 | 0.002 | 0.001 |
| 3.063052837249997 | 0.006 | 0.002 | 0.001 |
| 3.066194429903586 | 0.006 | 0.001 | 0.001 |
| 3.069336022557176 | 0.005 | 0.001 | 0.001 |
| 3.072477615210766 | 0.005 | 0.001 | 0.001 |
| 3.075619207864355 | 0.004 | 0.001 | 0 |
| 3.078760800517945 | 0.004 | 0.001 | 0 |
| 3.081902393171534 | 0.004 | 0.001 | 0 |
| 3.085043985825124 | 0.003 | 0.001 | 0 |
| 3.088185578478713 | 0.003 | 0.001 | 0 |
| 3.091327171132303 | 0.003 | 0.001 | 0 |
| 3.094468763785893 | 0.002 | 0.001 | 0 |
| 3.097610356439482 | 0.002 | 0 | 0 |
| 3.100751949093072 | 0.002 | 0 | 0 |
| 3.103893541746661 | 0.001 | 0 | 0 |
| 3.107035134400251 | 0.001 | 0 | 0 |
| 3.110176727053841 | 0.001 | 0 | 0 |
| 3.11331831970743 | 0.001 | 0 | 0 |
| 3.11645991236102 | 0.001 | 0 | 0 |
| 3.11960150501461 | 0 | 0 | 0 |
| 3.122743097668199 | 0 | 0 | 0 |
| 3.125884690321789 | 0 | 0 | 0 |
| 3.129026282975378 | 0 | 0 | 0 |
| 3.132167875628968 | 0 | 0 | 0 |
| 3.135309468282557 | 0 | 0 | 0 |
| 3.138451060936147 | 0 | 0 | 0 |
| 3.141592653589737 | 0 | 0 | 0 |
| 3.144734246243326 | 0 | 0 | 0 |
| 3.147875838896916 | 0 | 0 | 0 |
| 3.151017431550505 | 0 | 0 | 0 |
| 3.154159024204095 | 0 | 0 | 0 |
| 3.157300616857685 | 0 | 0 | 0 |
| 3.160442209511274 | 0 | 0 | 0 |
| 3.163583802164864 | 0 | 0 | 0 |
| 3.166725394818453 | 0.001 | 0 | 0 |
| 3.169866987472043 | 0.001 | 0 | 0 |
| 3.173008580125633 | 0.001 | 0 | 0 |
| 3.176150172779222 | 0.001 | 0 | 0 |
| 3.179291765432812 | 0.001 | 0 | 0 |
| 3.182433358086401 | 0.002 | 0 | 0 |
| 3.185574950739991 | 0.002 | 0 | 0 |
| 3.188716543393581 | 0.002 | 0.001 | 0 |
| 3.19185813604717 | 0.003 | 0.001 | 0 |
| 3.19499972870076 | 0.003 | 0.001 | 0 |
| 3.198141321354349 | 0.003 | 0.001 | 0 |
| 3.20128291400794 | 0.004 | 0.001 | 0 |
| 3.204424506661528 | 0.004 | 0.001 | 0 |
| 3.207566099315118 | 0.004 | 0.001 | 0 |
| 3.210707691968708 | 0.005 | 0.001 | 0.001 |
| 3.213849284622297 | 0.005 | 0.001 | 0.001 |
| 3.216990877275887 | 0.006 | 0.001 | 0.001 |
| 3.220132469929476 | 0.006 | 0.002 | 0.001 |
| 3.223274062583066 | 0.007 | 0.002 | 0.001 |
| 3.226415655236656 | 0.007 | 0.002 | 0.001 |
| 3.229557247890245 | 0.008 | 0.002 | 0.001 |
| 3.232698840543835 | 0.008 | 0.002 | 0.001 |
| 3.235840433197425 | 0.009 | 0.002 | 0.001 |
| 3.238982025851014 | 0.01 | 0.002 | 0.001 |
| 3.242123618504604 | 0.01 | 0.003 | 0.001 |
| 3.245265211158193 | 0.011 | 0.003 | 0.001 |
| 3.248406803811783 | 0.012 | 0.003 | 0.001 |
| 3.251548396465373 | 0.012 | 0.003 | 0.001 |
| 3.254689989118962 | 0.013 | 0.003 | 0.001 |
| 3.257831581772551 | 0.014 | 0.003 | 0.002 |
| 3.260973174426141 | 0.015 | 0.004 | 0.002 |
| 3.26411476707973 | 0.015 | 0.004 | 0.002 |
| 3.267256359733321 | 0.016 | 0.004 | 0.002 |
| 3.27039795238691 | 0.017 | 0.004 | 0.002 |
| 3.2735395450405 | 0.018 | 0.004 | 0.002 |
| 3.276681137694089 | 0.019 | 0.005 | 0.002 |
| 3.279822730347679 | 0.02 | 0.005 | 0.002 |
| 3.282964323001269 | 0.021 | 0.005 | 0.002 |
| 3.286105915654858 | 0.022 | 0.005 | 0.002 |
| 3.289247508308448 | 0.023 | 0.006 | 0.002 |
| 3.292389100962037 | 0.024 | 0.006 | 0.003 |
| 3.295530693615627 | 0.025 | 0.006 | 0.003 |
| 3.298672286269217 | 0.026 | 0.006 | 0.003 |
| 3.301813878922806 | 0.027 | 0.007 | 0.003 |
| 3.304955471576396 | 0.028 | 0.007 | 0.003 |
| 3.308097064229985 | 0.029 | 0.007 | 0.003 |
| 3.311238656883575 | 0.03 | 0.007 | 0.003 |
| 3.314380249537165 | 0.031 | 0.008 | 0.003 |
| 3.317521842190754 | 0.033 | 0.008 | 0.004 |
| 3.320663434844344 | 0.034 | 0.008 | 0.004 |
| 3.323805027497933 | 0.035 | 0.009 | 0.004 |
| 3.326946620151523 | 0.036 | 0.009 | 0.004 |
| 3.330088212805113 | 0.038 | 0.009 | 0.004 |
| 3.333229805458702 | 0.039 | 0.01 | 0.004 |
| 3.336371398112292 | 0.04 | 0.01 | 0.004 |
| 3.339512990765881 | 0.042 | 0.01 | 0.005 |
| 3.342654583419471 | 0.043 | 0.011 | 0.005 |
| 3.345796176073061 | 0.045 | 0.011 | 0.005 |
| 3.34893776872665 | 0.046 | 0.011 | 0.005 |
| 3.35207936138024 | 0.048 | 0.012 | 0.005 |
| 3.355220954033829 | 0.049 | 0.012 | 0.005 |
| 3.358362546687419 | 0.051 | 0.012 | 0.005 |
| 3.361504139341009 | 0.053 | 0.013 | 0.006 |
| 3.364645731994598 | 0.054 | 0.013 | 0.006 |
| 3.367787324648188 | 0.056 | 0.014 | 0.006 |
| 3.370928917301777 | 0.058 | 0.014 | 0.006 |
| 3.374070509955367 | 0.059 | 0.014 | 0.006 |
| 3.377212102608956 | 0.061 | 0.015 | 0.007 |
| 3.380353695262546 | 0.063 | 0.015 | 0.007 |
| 3.383495287916136 | 0.065 | 0.016 | 0.007 |
| 3.386636880569725 | 0.067 | 0.016 | 0.007 |
| 3.389778473223315 | 0.068 | 0.017 | 0.007 |
| 3.392920065876904 | 0.07 | 0.017 | 0.007 |
| 3.396061658530494 | 0.072 | 0.017 | 0.008 |
| 3.399203251184084 | 0.074 | 0.018 | 0.008 |
| 3.402344843837673 | 0.076 | 0.018 | 0.008 |
| 3.405486436491263 | 0.079 | 0.019 | 0.008 |
| 3.408628029144852 | 0.081 | 0.019 | 0.009 |
| 3.411769621798442 | 0.083 | 0.02 | 0.009 |
| 3.414911214452032 | 0.085 | 0.02 | 0.009 |
| 3.418052807105621 | 0.087 | 0.021 | 0.009 |
| 3.421194399759211 | 0.09 | 0.021 | 0.009 |
| 3.4243359924128 | 0.092 | 0.022 | 0.01 |
| 3.42747758506639 | 0.094 | 0.023 | 0.01 |
| 3.43061917771998 | 0.097 | 0.023 | 0.01 |
| 3.433760770373569 | 0.099 | 0.024 | 0.01 |
| 3.436902363027159 | 0.102 | 0.024 | 0.011 |
| 3.440043955680748 | 0.104 | 0.025 | 0.011 |
| 3.443185548334338 | 0.107 | 0.025 | 0.011 |
| 3.446327140987927 | 0.109 | 0.026 | 0.011 |
| 3.449468733641517 | 0.112 | 0.027 | 0.012 |
| 3.452610326295107 | 0.115 | 0.027 | 0.012 |
| 3.455751918948696 | 0.117 | 0.028 | 0.012 |
| 3.458893511602286 | 0.12 | 0.028 | 0.012 |
| 3.462035104255876 | 0.123 | 0.029 | 0.013 |
| 3.465176696909465 | 0.126 | 0.03 | 0.013 |
| 3.468318289563055 | 0.129 | 0.03 | 0.013 |
| 3.471459882216644 | 0.132 | 0.031 | 0.014 |
| 3.474601474870234 | 0.135 | 0.032 | 0.014 |
| 3.477743067523824 | 0.138 | 0.032 | 0.014 |
| 3.480884660177413 | 0.141 | 0.033 | 0.014 |
| 3.484026252831002 | 0.144 | 0.034 | 0.015 |
| 3.487167845484592 | 0.148 | 0.035 | 0.015 |
| 3.490309438138182 | 0.151 | 0.035 | 0.015 |
| 3.493451030791772 | 0.154 | 0.036 | 0.016 |
| 3.496592623445361 | 0.158 | 0.037 | 0.016 |
| 3.499734216098951 | 0.161 | 0.038 | 0.016 |
| 3.50287580875254 | 0.165 | 0.038 | 0.017 |
| 3.50601740140613 | 0.168 | 0.039 | 0.017 |
| 3.50915899405972 | 0.172 | 0.04 | 0.017 |
| 3.512300586713309 | 0.176 | 0.041 | 0.018 |
| 3.515442179366899 | 0.18 | 0.041 | 0.018 |
| 3.518583772020488 | 0.183 | 0.042 | 0.018 |
| 3.521725364674078 | 0.187 | 0.043 | 0.019 |
| 3.524866957327668 | 0.191 | 0.044 | 0.019 |
| 3.528008549981257 | 0.195 | 0.045 | 0.019 |
| 3.531150142634847 | 0.2 | 0.046 | 0.02 |
| 3.534291735288436 | 0.204 | 0.047 | 0.02 |
| 3.537433327942026 | 0.208 | 0.048 | 0.021 |
| 3.540574920595616 | 0.212 | 0.048 | 0.021 |
| 3.543716513249205 | 0.217 | 0.049 | 0.021 |
| 3.546858105902795 | 0.221 | 0.05 | 0.022 |
| 3.549999698556384 | 0.226 | 0.051 | 0.022 |
| 3.553141291209974 | 0.231 | 0.052 | 0.023 |
| 3.556282883863564 | 0.235 | 0.053 | 0.023 |
| 3.559424476517153 | 0.24 | 0.054 | 0.023 |
| 3.562566069170743 | 0.245 | 0.055 | 0.024 |
| 3.565707661824332 | 0.25 | 0.056 | 0.024 |
| 3.568849254477922 | 0.255 | 0.057 | 0.025 |
| 3.571990847131511 | 0.26 | 0.058 | 0.025 |
| 3.575132439785101 | 0.266 | 0.059 | 0.026 |
| 3.578274032438691 | 0.271 | 0.061 | 0.026 |
| 3.58141562509228 | 0.277 | 0.062 | 0.026 |
| 3.58455721774587 | 0.282 | 0.063 | 0.027 |
| 3.58769881039946 | 0.288 | 0.064 | 0.027 |
| 3.590840403053049 | 0.294 | 0.065 | 0.028 |
| 3.593981995706639 | 0.299 | 0.066 | 0.028 |
| 3.597123588360228 | 0.305 | 0.067 | 0.029 |
| 3.600265181013818 | 0.312 | 0.069 | 0.029 |
| 3.603406773667407 | 0.318 | 0.07 | 0.03 |
| 3.606548366320997 | 0.324 | 0.071 | 0.03 |
| 3.609689958974587 | 0.33 | 0.072 | 0.031 |
| 3.612831551628176 | 0.337 | 0.074 | 0.031 |
| 3.615973144281766 | 0.344 | 0.075 | 0.032 |
| 3.619114736935355 | 0.351 | 0.076 | 0.032 |
| 3.622256329588945 | 0.357 | 0.078 | 0.033 |
| 3.625397922242534 | 0.364 | 0.079 | 0.034 |
| 3.628539514896124 | 0.372 | 0.08 | 0.034 |
| 3.631681107549714 | 0.379 | 0.082 | 0.035 |
| 3.634822700203303 | 0.386 | 0.083 | 0.035 |
| 3.637964292856893 | 0.394 | 0.085 | 0.036 |
| 3.641105885510483 | 0.402 | 0.086 | 0.036 |
| 3.644247478164072 | 0.41 | 0.087 | 0.037 |
| 3.647389070817662 | 0.418 | 0.089 | 0.038 |
| 3.650530663471251 | 0.426 | 0.09 | 0.038 |
| 3.653672256124841 | 0.434 | 0.092 | 0.039 |
| 3.656813848778431 | 0.443 | 0.094 | 0.039 |
| 3.65995544143202 | 0.452 | 0.095 | 0.04 |
| 3.66309703408561 | 0.46 | 0.097 | 0.041 |
| 3.666238626739199 | 0.47 | 0.098 | 0.041 |
| 3.66938021939279 | 0.479 | 0.1 | 0.042 |
| 3.672521812046378 | 0.488 | 0.102 | 0.043 |
| 3.675663404699968 | 0.498 | 0.104 | 0.043 |
| 3.678804997353558 | 0.508 | 0.105 | 0.044 |
| 3.681946590007147 | 0.518 | 0.107 | 0.045 |
| 3.685088182660737 | 0.528 | 0.109 | 0.046 |
| 3.688229775314326 | 0.538 | 0.111 | 0.046 |
| 3.691371367967916 | 0.549 | 0.112 | 0.047 |
| 3.694512960621506 | 0.56 | 0.114 | 0.048 |
| 3.697654553275095 | 0.571 | 0.116 | 0.048 |
| 3.700796145928685 | 0.582 | 0.118 | 0.049 |
| 3.703937738582274 | 0.594 | 0.12 | 0.05 |
| 3.707079331235864 | 0.605 | 0.122 | 0.051 |
| 3.710220923889454 | 0.617 | 0.124 | 0.052 |
| 3.713362516543043 | 0.63 | 0.126 | 0.052 |
| 3.716504109196633 | 0.642 | 0.128 | 0.053 |
| 3.719645701850223 | 0.655 | 0.13 | 0.054 |
| 3.722787294503812 | 0.668 | 0.133 | 0.055 |
| 3.725928887157402 | 0.682 | 0.135 | 0.056 |
| 3.729070479810991 | 0.695 | 0.137 | 0.057 |
| 3.732212072464581 | 0.709 | 0.139 | 0.057 |
| 3.735353665118171 | 0.724 | 0.142 | 0.058 |
| 3.73849525777176 | 0.738 | 0.144 | 0.059 |
| 3.74163685042535 | 0.753 | 0.146 | 0.06 |
| 3.744778443078939 | 0.769 | 0.149 | 0.061 |
| 3.747920035732529 | 0.784 | 0.151 | 0.062 |
| 3.751061628386119 | 0.8 | 0.154 | 0.063 |
| 3.754203221039708 | 0.817 | 0.156 | 0.064 |
| 3.757344813693298 | 0.833 | 0.159 | 0.065 |
| 3.760486406346887 | 0.851 | 0.162 | 0.066 |
| 3.763627999000477 | 0.868 | 0.164 | 0.067 |
| 3.766769591654067 | 0.886 | 0.167 | 0.068 |
| 3.769911184307656 | 0.905 | 0.17 | 0.069 |
| 3.773052776961246 | 0.923 | 0.172 | 0.07 |
| 3.776194369614835 | 0.943 | 0.175 | 0.071 |
| 3.779335962268425 | 0.962 | 0.178 | 0.072 |
| 3.782477554922014 | 0.983 | 0.181 | 0.073 |
| 3.785619147575604 | 1.004 | 0.184 | 0.075 |
| 3.788760740229193 | 1.025 | 0.187 | 0.076 |
| 3.791902332882783 | 1.047 | 0.19 | 0.077 |
| 3.795043925536373 | 1.069 | 0.194 | 0.078 |
| 3.798185518189962 | 1.092 | 0.197 | 0.079 |
| 3.801327110843552 | 1.115 | 0.2 | 0.08 |
| 3.804468703497142 | 1.14 | 0.203 | 0.082 |
| 3.807610296150731 | 1.164 | 0.207 | 0.083 |
| 3.810751888804321 | 1.19 | 0.21 | 0.084 |
| 3.813893481457911 | 1.216 | 0.214 | 0.086 |
| 3.8170350741115 | 1.243 | 0.217 | 0.087 |
| 3.82017666676509 | 1.27 | 0.221 | 0.088 |
| 3.823318259418679 | 1.299 | 0.225 | 0.09 |
| 3.826459852072269 | 1.328 | 0.228 | 0.091 |
| 3.829601444725859 | 1.357 | 0.232 | 0.092 |
| 3.832743037379448 | 1.388 | 0.236 | 0.094 |
| 3.835884630033038 | 1.42 | 0.24 | 0.095 |
| 3.839026222686627 | 1.452 | 0.244 | 0.097 |
| 3.842167815340217 | 1.485 | 0.248 | 0.098 |
| 3.845309407993807 | 1.52 | 0.253 | 0.1 |
| 3.848451000647396 | 1.555 | 0.257 | 0.101 |
| 3.851592593300986 | 1.591 | 0.261 | 0.103 |
| 3.854734185954575 | 1.629 | 0.266 | 0.104 |
| 3.857875778608165 | 1.667 | 0.27 | 0.106 |
| 3.861017371261755 | 1.707 | 0.275 | 0.108 |
| 3.864158963915344 | 1.748 | 0.28 | 0.109 |
| 3.867300556568933 | 1.79 | 0.285 | 0.111 |
| 3.870442149222523 | 1.833 | 0.289 | 0.113 |
| 3.873583741876112 | 1.878 | 0.295 | 0.114 |
| 3.876725334529703 | 1.924 | 0.3 | 0.116 |
| 3.879866927183292 | 1.972 | 0.305 | 0.118 |
| 3.883008519836882 | 2.021 | 0.31 | 0.12 |
| 3.886150112490471 | 2.072 | 0.316 | 0.122 |
| 3.889291705144061 | 2.124 | 0.321 | 0.124 |
| 3.892433297797651 | 2.179 | 0.327 | 0.126 |
| 3.89557489045124 | 2.235 | 0.333 | 0.128 |
| 3.89871648310483 | 2.292 | 0.339 | 0.13 |
| 3.901858075758419 | 2.352 | 0.345 | 0.132 |
| 3.904999668412009 | 2.414 | 0.351 | 0.134 |
| 3.908141261065598 | 2.478 | 0.357 | 0.136 |
| 3.911282853719188 | 2.545 | 0.363 | 0.138 |
| 3.914424446372778 | 2.613 | 0.37 | 0.14 |
| 3.917566039026367 | 2.685 | 0.377 | 0.143 |
| 3.920707631679957 | 2.758 | 0.384 | 0.145 |
| 3.923849224333547 | 2.835 | 0.391 | 0.147 |
| 3.926990816987136 | 2.914 | 0.398 | 0.15 |
| 3.930132409640726 | 2.997 | 0.405 | 0.152 |
| 3.933274002294315 | 3.082 | 0.412 | 0.154 |
| 3.936415594947905 | 3.171 | 0.42 | 0.157 |
| 3.939557187601495 | 3.263 | 0.428 | 0.159 |
| 3.942698780255084 | 3.359 | 0.436 | 0.162 |
| 3.945840372908674 | 3.459 | 0.444 | 0.165 |
| 3.948981965562263 | 3.563 | 0.452 | 0.167 |
| 3.952123558215853 | 3.671 | 0.461 | 0.17 |
| 3.955265150869442 | 3.783 | 0.47 | 0.173 |
| 3.958406743523032 | 3.901 | 0.479 | 0.176 |
| 3.961548336176622 | 4.023 | 0.488 | 0.179 |
| 3.964689928830211 | 4.151 | 0.497 | 0.182 |
| 3.967831521483801 | 4.284 | 0.507 | 0.185 |
| 3.97097311413739 | 4.423 | 0.517 | 0.188 |
| 3.97411470679098 | 4.569 | 0.527 | 0.191 |
| 3.97725629944457 | 4.721 | 0.537 | 0.194 |
| 3.98039789209816 | 4.881 | 0.548 | 0.198 |
| 3.983539484751749 | 5.047 | 0.559 | 0.201 |
| 3.986681077405338 | 5.222 | 0.57 | 0.204 |
| 3.989822670058928 | 5.406 | 0.581 | 0.208 |
| 3.992964262712517 | 5.598 | 0.593 | 0.211 |
| 3.996105855366107 | 5.801 | 0.605 | 0.215 |
| 3.999247448019697 | 6.013 | 0.617 | 0.219 |
| 4.002389040673287 | 6.237 | 0.63 | 0.223 |
| 4.005530633326877 | 6.472 | 0.643 | 0.226 |
| 4.008672225980466 | 6.72 | 0.656 | 0.23 |
| 4.011813818634056 | 6.982 | 0.67 | 0.235 |
| 4.014955411287645 | 7.258 | 0.684 | 0.239 |
| 4.018097003941234 | 7.55 | 0.699 | 0.243 |
| 4.021238596594824 | 7.859 | 0.713 | 0.247 |
| 4.024380189248414 | 8.186 | 0.729 | 0.252 |
| 4.027521781902004 | 8.533 | 0.744 | 0.256 |
| 4.030663374555593 | 8.901 | 0.76 | 0.261 |
| 4.033804967209183 | 9.292 | 0.777 | 0.266 |
| 4.036946559862773 | 9.707 | 0.794 | 0.27 |
| 4.040088152516362 | 10.15 | 0.812 | 0.275 |
| 4.043229745169951 | 10.623 | 0.83 | 0.28 |
| 4.046371337823541 | 11.127 | 0.849 | 0.286 |
| 4.049512930477131 | 11.666 | 0.868 | 0.291 |
| 4.05265452313072 | 12.244 | 0.888 | 0.296 |
| 4.05579611578431 | 12.864 | 0.908 | 0.302 |
| 4.0589377084379 | 13.53 | 0.929 | 0.308 |
| 4.062079301091489 | 14.246 | 0.951 | 0.313 |
| 4.065220893745079 | 15.019 | 0.973 | 0.319 |
| 4.068362486398668 | 15.854 | 0.996 | 0.325 |
| 4.071504079052258 | 16.758 | 1.02 | 0.332 |
| 4.074645671705848 | 17.738 | 1.044 | 0.338 |
| 4.077787264359437 | 18.803 | 1.07 | 0.345 |
| 4.080928857013027 | 19.965 | 1.096 | 0.352 |
| 4.084070449666616 | 21.233 | 1.123 | 0.359 |
| 4.087212042320206 | 22.622 | 1.151 | 0.366 |
| 4.090353634973795 | 24.148 | 1.18 | 0.373 |
| 4.093495227627385 | 25.829 | 1.21 | 0.38 |
| 4.096636820280975 | 27.686 | 1.241 | 0.388 |
| 4.099778412934564 | 29.746 | 1.273 | 0.396 |
| 4.102920005588154 | 32.037 | 1.307 | 0.404 |
| 4.106061598241744 | 34.597 | 1.341 | 0.413 |
| 4.109203190895333 | 37.469 | 1.377 | 0.421 |
| 4.112344783548923 | 40.705 | 1.414 | 0.43 |
| 4.115486376202512 | 44.37 | 1.453 | 0.439 |
| 4.118627968856102 | 48.541 | 1.492 | 0.448 |
| 4.121769561509692 | 53.317 | 1.534 | 0.458 |
| 4.124911154163281 | 58.82 | 1.577 | 0.468 |
| 4.128052746816871 | 65.205 | 1.622 | 0.478 |
| 4.13119433947046 | 72.67 | 1.668 | 0.488 |
| 4.13433593212405 | 81.472 | 1.717 | 0.499 |
| 4.13747752477764 | 91.949 | 1.767 | 0.51 |
| 4.14061911743123 | 104.554 | 1.82 | 0.522 |
| 4.143760710084818 | 119.903 | 1.875 | 0.533 |
| 4.146902302738408 | 138.85 | 1.932 | 0.545 |
| 4.150043895391998 | 162.613 | 1.991 | 0.558 |
| 4.153185488045588 | 192.967 | 2.054 | 0.571 |
| 4.156327080699177 | 232.591 | 2.118 | 0.584 |
| 4.159468673352766 | 285.672 | 2.186 | 0.598 |
| 4.162610266006356 | 359.056 | 2.257 | 0.612 |
| 4.165751858659946 | 464.566 | 2.332 | 0.627 |
| 4.168893451313535 | 624.062 | 2.41 | 0.642 |
| 4.172035043967125 | 881.716 | 2.491 | 0.657 |
| 4.175176636620715 | 1338.161 | 2.577 | 0.673 |
| 4.178318229274304 | 2265.756 | 2.666 | 0.69 |
| 4.181459821927894 | 4632.626 | 2.761 | 0.707 |
| 4.184601414581484 | 14213.646 | 2.86 | 0.725 |
| 4.187743007235073 | 227834.643 | 2.964 | 0.744 |
| 4.190884599888663 | 57061.894 | 3.074 | 0.763 |
| 4.194026192542252 | 9146.285 | 3.19 | 0.783 |
| 4.197167785195842 | 3579.114 | 3.312 | 0.803 |
| 4.200309377849432 | 1896.414 | 3.44 | 0.825 |
| 4.203450970503021 | 1172.783 | 3.577 | 0.847 |
| 4.206592563156611 | 796.753 | 3.721 | 0.87 |
| 4.2097341558102 | 576.636 | 3.873 | 0.894 |
| 4.21287574846379 | 436.755 | 4.035 | 0.918 |
| 4.21601734111738 | 342.351 | 4.207 | 0.944 |
| 4.21915893377097 | 275.638 | 4.389 | 0.971 |
| 4.222300526424559 | 226.749 | 4.583 | 0.999 |
| 4.225442119078148 | 189.85 | 4.79 | 1.028 |
| 4.228583711731738 | 161.315 | 5.011 | 1.058 |
| 4.231725304385327 | 138.791 | 5.247 | 1.09 |
| 4.234866897038917 | 120.699 | 5.499 | 1.122 |
| 4.238008489692506 | 105.946 | 5.769 | 1.157 |
| 4.241150082346096 | 93.758 | 6.059 | 1.192 |
| 4.244291674999685 | 83.57 | 6.371 | 1.23 |
| 4.247433267653276 | 74.969 | 6.707 | 1.269 |
| 4.250574860306865 | 67.639 | 7.069 | 1.31 |
| 4.253716452960455 | 61.341 | 7.46 | 1.352 |
| 4.256858045614044 | 55.89 | 7.885 | 1.397 |
| 4.259999638267634 | 51.141 | 8.345 | 1.444 |
| 4.263141230921224 | 46.977 | 8.846 | 1.493 |
| 4.266282823574813 | 43.306 | 9.392 | 1.545 |
| 4.269424416228403 | 40.052 | 9.989 | 1.599 |
| 4.272566008881992 | 37.155 | 10.644 | 1.656 |
| 4.275707601535582 | 34.565 | 11.364 | 1.716 |
| 4.27884919418917 | 32.238 | 12.158 | 1.779 |
| 4.28199078684276 | 30.141 | 13.037 | 1.846 |
| 4.285132379496351 | 28.244 | 14.013 | 1.916 |
| 4.28827397214994 | 26.523 | 15.1 | 1.99 |
| 4.29141556480353 | 24.955 | 16.317 | 2.068 |
| 4.294557157457119 | 23.524 | 17.684 | 2.151 |
| 4.29769875011071 | 22.214 | 19.229 | 2.239 |
| 4.300840342764299 | 21.012 | 20.981 | 2.332 |
| 4.303981935417888 | 19.905 | 22.981 | 2.431 |
| 4.307123528071478 | 18.885 | 25.277 | 2.536 |
| 4.310265120725067 | 17.942 | 27.931 | 2.648 |
| 4.313406713378657 | 17.068 | 31.021 | 2.767 |
| 4.316548306032247 | 16.258 | 34.647 | 2.894 |
| 4.319689898685836 | 15.504 | 38.941 | 3.03 |
| 4.322831491339426 | 14.803 | 44.078 | 3.176 |
| 4.325973083993015 | 14.148 | 50.292 | 3.331 |
| 4.329114676646605 | 13.536 | 57.907 | 3.499 |
| 4.332256269300195 | 12.964 | 67.376 | 3.678 |
| 4.335397861953784 | 12.427 | 79.355 | 3.872 |
| 4.338539454607374 | 11.924 | 94.813 | 4.081 |
| 4.341681047260963 | 11.45 | 115.238 | 4.307 |
| 4.344822639914553 | 11.005 | 143.008 | 4.552 |
| 4.347964232568143 | 10.585 | 182.113 | 4.818 |
| 4.351105825221732 | 10.189 | 239.667 | 5.108 |
| 4.354247417875322 | 9.816 | 329.392 | 5.424 |
| 4.357389010528911 | 9.462 | 480.595 | 5.77 |
| 4.360530603182501 | 9.128 | 765.506 | 6.149 |
| 4.36367219583609 | 8.811 | 1404.605 | 6.566 |
| 4.36681378848968 | 8.51 | 3367.454 | 7.026 |
| 4.36995538114327 | 8.225 | 16463.282 | 7.536 |
| 4.373096973796859 | 7.954 | 374285.39 | 8.103 |
| 4.376238566450449 | 7.696 | 8186.375 | 8.735 |
| 4.379380159104038 | 7.451 | 2388.869 | 9.442 |
| 4.382521751757628 | 7.217 | 1121.742 | 10.239 |
| 4.385663344411217 | 6.994 | 649.269 | 11.139 |
| 4.388804937064807 | 6.782 | 422.967 | 12.162 |
| 4.391946529718397 | 6.579 | 297.342 | 13.331 |
| 4.395088122371987 | 6.385 | 220.443 | 14.675 |
| 4.398229715025576 | 6.2 | 169.971 | 16.231 |
| 4.401371307679165 | 6.022 | 135.066 | 18.046 |
| 4.404512900332755 | 5.852 | 109.925 | 20.18 |
| 4.407654492986345 | 5.69 | 91.216 | 22.713 |
| 4.410796085639934 | 5.534 | 76.918 | 25.751 |
| 4.413937678293524 | 5.384 | 65.744 | 29.438 |
| 4.417079270947114 | 5.24 | 56.846 | 33.971 |
| 4.420220863600703 | 5.102 | 49.644 | 39.631 |
| 4.423362456254293 | 4.97 | 43.733 | 46.824 |
| 4.426504048907883 | 4.842 | 38.822 | 56.158 |
| 4.429645641561472 | 4.72 | 34.697 | 68.574 |
| 4.432787234215062 | 4.602 | 31.198 | 85.593 |
| 4.435928826868651 | 4.488 | 28.205 | 109.804 |
| 4.43907041952224 | 4.379 | 25.624 | 145.91 |
| 4.44221201217583 | 4.273 | 23.384 | 203.193 |
| 4.44535360482942 | 4.172 | 21.426 | 302.129 |
| 4.44849519748301 | 4.073 | 19.705 | 495.563 |
| 4.4516367901366 | 3.979 | 18.184 | 957.192 |
| 4.454778382790188 | 3.887 | 16.834 | 2567.825 |
| 4.457919975443779 | 3.799 | 15.629 | 19524.47 |
| 4.461061568097368 | 3.714 | 14.549 | 34161.462 |
| 4.464203160750958 | 3.631 | 13.578 | 3097.615 |
| 4.467344753404547 | 3.551 | 12.702 | 1073.948 |
| 4.470486346058137 | 3.474 | 11.908 | 539.519 |
| 4.473627938711726 | 3.399 | 11.187 | 323.706 |
| 4.476769531365316 | 3.327 | 10.529 | 215.627 |
| 4.479911124018905 | 3.257 | 9.928 | 153.891 |
| 4.483052716672495 | 3.189 | 9.377 | 115.34 |
| 4.486194309326085 | 3.123 | 8.871 | 89.663 |
| 4.489335901979674 | 3.059 | 8.405 | 71.705 |
| 4.492477494633264 | 2.997 | 7.975 | 58.655 |
| 4.495619087286854 | 2.937 | 7.578 | 48.873 |
| 4.498760679940443 | 2.879 | 7.209 | 41.353 |
| 4.501902272594033 | 2.822 | 6.867 | 35.446 |
| 4.505043865247622 | 2.767 | 6.548 | 30.723 |
| 4.508185457901212 | 2.714 | 6.252 | 26.886 |
| 4.511327050554801 | 2.662 | 5.975 | 23.727 |
| 4.514468643208391 | 2.611 | 5.716 | 21.095 |
| 4.517610235861981 | 2.562 | 5.473 | 18.878 |
| 4.520751828515571 | 2.515 | 5.246 | 16.994 |
| 4.52389342116916 | 2.468 | 5.033 | 15.38 |
| 4.52703501382275 | 2.423 | 4.832 | 13.985 |
| 4.530176606476339 | 2.379 | 4.643 | 12.773 |
| 4.533318199129928 | 2.336 | 4.466 | 11.711 |
| 4.536459791783518 | 2.295 | 4.298 | 10.777 |
| 4.539601384437108 | 2.254 | 4.139 | 9.951 |
| 4.542742977090698 | 2.215 | 3.989 | 9.217 |
| 4.545884569744287 | 2.176 | 3.847 | 8.561 |
| 4.549026162397876 | 2.138 | 3.713 | 7.972 |
| 4.552167755051466 | 2.102 | 3.585 | 7.443 |
| 4.555309347705056 | 2.066 | 3.464 | 6.964 |
| 4.558450940358646 | 2.031 | 3.349 | 6.531 |
| 4.561592533012235 | 1.997 | 3.239 | 6.137 |
| 4.564734125665825 | 1.964 | 3.135 | 5.777 |
| 4.567875718319415 | 1.932 | 3.036 | 5.448 |
| 4.571017310973004 | 1.9 | 2.941 | 5.147 |
| 4.574158903626594 | 1.869 | 2.851 | 4.87 |
| 4.577300496280183 | 1.839 | 2.764 | 4.614 |
| 4.580442088933772 | 1.81 | 2.682 | 4.379 |
| 4.583583681587362 | 1.781 | 2.603 | 4.16 |
| 4.586725274240952 | 1.753 | 2.528 | 3.958 |
| 4.589866866894542 | 1.726 | 2.456 | 3.77 |
| 4.593008459548131 | 1.699 | 2.387 | 3.596 |
| 4.596150052201721 | 1.672 | 2.32 | 3.433 |
| 4.59929164485531 | 1.647 | 2.257 | 3.281 |
| 4.6024332375089 | 1.622 | 2.196 | 3.138 |
| 4.60557483016249 | 1.597 | 2.137 | 3.005 |
| 4.608716422816079 | 1.573 | 2.081 | 2.88 |
| 4.611858015469668 | 1.55 | 2.027 | 2.763 |
| 4.614999608123258 | 1.527 | 1.974 | 2.653 |
| 4.618141200776848 | 1.504 | 1.924 | 2.549 |
| 4.621282793430437 | 1.482 | 1.876 | 2.451 |
| 4.624424386084027 | 1.46 | 1.83 | 2.359 |
| 4.627565978737617 | 1.439 | 1.785 | 2.272 |
| 4.630707571391206 | 1.419 | 1.742 | 2.189 |
| 4.633849164044795 | 1.398 | 1.7 | 2.111 |
| 4.636990756698386 | 1.378 | 1.66 | 2.037 |
| 4.640132349351975 | 1.359 | 1.621 | 1.967 |
| 4.643273942005564 | 1.34 | 1.583 | 1.9 |
| 4.646415534659154 | 1.321 | 1.547 | 1.837 |
| 4.649557127312744 | 1.303 | 1.512 | 1.776 |
| 4.652698719966334 | 1.285 | 1.478 | 1.719 |
| 4.655840312619923 | 1.267 | 1.445 | 1.664 |
| 4.658981905273513 | 1.25 | 1.414 | 1.612 |
| 4.662123497927102 | 1.233 | 1.383 | 1.562 |
| 4.665265090580692 | 1.216 | 1.353 | 1.515 |
| 4.668406683234282 | 1.2 | 1.324 | 1.47 |
| 4.671548275887871 | 1.184 | 1.296 | 1.426 |
| 4.674689868541461 | 1.168 | 1.269 | 1.385 |
| 4.67783146119505 | 1.153 | 1.243 | 1.345 |
| 4.68097305384864 | 1.137 | 1.218 | 1.307 |
| 4.68411464650223 | 1.123 | 1.193 | 1.27 |
| 4.687256239155819 | 1.108 | 1.169 | 1.235 |
| 4.690397831809409 | 1.094 | 1.146 | 1.202 |
| 4.693539424462998 | 1.079 | 1.123 | 1.169 |
| 4.696681017116588 | 1.066 | 1.101 | 1.138 |
| 4.699822609770177 | 1.052 | 1.08 | 1.108 |
| 4.702964202423767 | 1.039 | 1.059 | 1.08 |
| 4.706105795077356 | 1.026 | 1.039 | 1.052 |
| 4.709247387730946 | 1.013 | 1.019 | 1.026 |
| 4.712388980384535 | 1 | 1 | 1 |
| 4.715530573038126 | 0.988 | 0.981 | 0.975 |
| 4.718672165691715 | 0.975 | 0.963 | 0.952 |
| 4.721813758345305 | 0.963 | 0.946 | 0.929 |
| 4.724955350998894 | 0.951 | 0.929 | 0.906 |
| 4.728096943652484 | 0.94 | 0.912 | 0.885 |
| 4.731238536306074 | 0.928 | 0.896 | 0.864 |
| 4.734380128959663 | 0.917 | 0.88 | 0.844 |
| 4.737521721613253 | 0.906 | 0.864 | 0.825 |
| 4.740663314266842 | 0.895 | 0.849 | 0.806 |
| 4.743804906920432 | 0.884 | 0.834 | 0.788 |
| 4.74694649957402 | 0.874 | 0.82 | 0.771 |
| 4.750088092227611 | 0.863 | 0.806 | 0.754 |
| 4.7532296848812 | 0.853 | 0.792 | 0.738 |
| 4.75637127753479 | 0.843 | 0.779 | 0.722 |
| 4.75951287018838 | 0.833 | 0.766 | 0.706 |
| 4.76265446284197 | 0.824 | 0.753 | 0.692 |
| 4.765796055495559 | 0.814 | 0.741 | 0.677 |
| 4.768937648149149 | 0.805 | 0.729 | 0.663 |
| 4.772079240802738 | 0.795 | 0.717 | 0.649 |
| 4.775220833456327 | 0.786 | 0.705 | 0.636 |
| 4.778362426109917 | 0.777 | 0.694 | 0.623 |
| 4.781504018763507 | 0.768 | 0.683 | 0.611 |
| 4.784645611417097 | 0.76 | 0.672 | 0.599 |
| 4.787787204070686 | 0.751 | 0.662 | 0.587 |
| 4.790928796724275 | 0.743 | 0.651 | 0.576 |
| 4.794070389377865 | 0.734 | 0.641 | 0.565 |
| 4.797211982031455 | 0.726 | 0.631 | 0.554 |
| 4.800353574685045 | 0.718 | 0.622 | 0.543 |
| 4.803495167338634 | 0.71 | 0.612 | 0.533 |
| 4.806636759992224 | 0.702 | 0.603 | 0.523 |
| 4.809778352645814 | 0.694 | 0.594 | 0.513 |
| 4.812919945299403 | 0.687 | 0.585 | 0.504 |
| 4.816061537952993 | 0.679 | 0.576 | 0.495 |
| 4.819203130606582 | 0.672 | 0.568 | 0.486 |
| 4.822344723260172 | 0.664 | 0.559 | 0.477 |
| 4.825486315913761 | 0.657 | 0.551 | 0.469 |
| 4.828627908567351 | 0.65 | 0.543 | 0.46 |
| 4.83176950122094 | 0.643 | 0.535 | 0.452 |
| 4.83491109387453 | 0.636 | 0.527 | 0.444 |
| 4.83805268652812 | 0.629 | 0.52 | 0.437 |
| 4.841194279181709 | 0.623 | 0.512 | 0.429 |
| 4.844335871835299 | 0.616 | 0.505 | 0.422 |
| 4.847477464488889 | 0.609 | 0.498 | 0.415 |
| 4.850619057142478 | 0.603 | 0.491 | 0.408 |
| 4.853760649796068 | 0.597 | 0.484 | 0.401 |
| 4.856902242449657 | 0.59 | 0.478 | 0.394 |
| 4.860043835103247 | 0.584 | 0.471 | 0.388 |
| 4.863185427756837 | 0.578 | 0.464 | 0.381 |
| 4.866327020410426 | 0.572 | 0.458 | 0.375 |
| 4.869468613064015 | 0.566 | 0.452 | 0.369 |
| 4.872610205717605 | 0.56 | 0.446 | 0.363 |
| 4.875751798371195 | 0.554 | 0.44 | 0.357 |
| 4.878893391024784 | 0.549 | 0.434 | 0.352 |
| 4.882034983678374 | 0.543 | 0.428 | 0.346 |
| 4.885176576331964 | 0.537 | 0.422 | 0.341 |
| 4.888318168985553 | 0.532 | 0.417 | 0.335 |
| 4.891459761639143 | 0.526 | 0.411 | 0.33 |
| 4.894601354292733 | 0.521 | 0.406 | 0.325 |
| 4.897742946946322 | 0.516 | 0.401 | 0.32 |
| 4.900884539599912 | 0.511 | 0.395 | 0.315 |
| 4.904026132253501 | 0.505 | 0.39 | 0.31 |
| 4.907167724907091 | 0.5 | 0.385 | 0.306 |
| 4.91030931756068 | 0.495 | 0.38 | 0.301 |
| 4.91345091021427 | 0.49 | 0.375 | 0.297 |
| 4.91659250286786 | 0.485 | 0.371 | 0.292 |
| 4.91973409552145 | 0.48 | 0.366 | 0.288 |
| 4.922875688175039 | 0.476 | 0.361 | 0.284 |
| 4.926017280828628 | 0.471 | 0.357 | 0.28 |
| 4.929158873482218 | 0.466 | 0.352 | 0.276 |
| 4.932300466135808 | 0.462 | 0.348 | 0.272 |
| 4.935442058789397 | 0.457 | 0.344 | 0.268 |
| 4.938583651442987 | 0.453 | 0.339 | 0.264 |
| 4.941725244096576 | 0.448 | 0.335 | 0.26 |
| 4.944866836750166 | 0.444 | 0.331 | 0.256 |
| 4.948008429403755 | 0.439 | 0.327 | 0.253 |
| 4.951150022057345 | 0.435 | 0.323 | 0.249 |
| 4.954291614710935 | 0.431 | 0.319 | 0.246 |
| 4.957433207364524 | 0.427 | 0.315 | 0.242 |
| 4.960574800018114 | 0.423 | 0.311 | 0.239 |
| 4.963716392671704 | 0.418 | 0.308 | 0.236 |
| 4.966857985325293 | 0.414 | 0.304 | 0.233 |
| 4.969999577978883 | 0.41 | 0.3 | 0.229 |
| 4.973141170632472 | 0.406 | 0.297 | 0.226 |
| 4.976282763286062 | 0.402 | 0.293 | 0.223 |
| 4.979424355939651 | 0.399 | 0.29 | 0.22 |
| 4.982565948593241 | 0.395 | 0.286 | 0.217 |
| 4.985707541246831 | 0.391 | 0.283 | 0.214 |
| 4.98884913390042 | 0.387 | 0.28 | 0.212 |
| 4.99199072655401 | 0.384 | 0.276 | 0.209 |
| 4.9951323192076 | 0.38 | 0.273 | 0.206 |
| 4.99827391186119 | 0.376 | 0.27 | 0.203 |
| 5.00141550451478 | 0.373 | 0.267 | 0.201 |
| 5.004557097168369 | 0.369 | 0.264 | 0.198 |
| 5.007698689821958 | 0.366 | 0.261 | 0.195 |
| 5.010840282475548 | 0.362 | 0.258 | 0.193 |
| 5.013981875129137 | 0.359 | 0.255 | 0.19 |
| 5.017123467782727 | 0.355 | 0.252 | 0.188 |
| 5.020265060436317 | 0.352 | 0.249 | 0.186 |
| 5.023406653089906 | 0.349 | 0.246 | 0.183 |
| 5.026548245743496 | 0.345 | 0.244 | 0.181 |
| 5.029689838397085 | 0.342 | 0.241 | 0.179 |
| 5.032831431050674 | 0.339 | 0.238 | 0.176 |
| 5.035973023704264 | 0.336 | 0.235 | 0.174 |
| 5.039114616357854 | 0.333 | 0.233 | 0.172 |
| 5.042256209011444 | 0.33 | 0.23 | 0.17 |
| 5.045397801665033 | 0.327 | 0.228 | 0.168 |
| 5.048539394318622 | 0.324 | 0.225 | 0.166 |
| 5.051680986972213 | 0.321 | 0.223 | 0.164 |
| 5.054822579625802 | 0.318 | 0.22 | 0.162 |
| 5.057964172279392 | 0.315 | 0.218 | 0.16 |
| 5.061105764932981 | 0.312 | 0.215 | 0.158 |
| 5.064247357586571 | 0.309 | 0.213 | 0.156 |
| 5.067388950240161 | 0.306 | 0.211 | 0.154 |
| 5.07053054289375 | 0.303 | 0.208 | 0.152 |
| 5.07367213554734 | 0.3 | 0.206 | 0.15 |
| 5.07681372820093 | 0.298 | 0.204 | 0.148 |
| 5.079955320854519 | 0.295 | 0.202 | 0.147 |
| 5.083096913508108 | 0.292 | 0.199 | 0.145 |
| 5.086238506161698 | 0.289 | 0.197 | 0.143 |
| 5.089380098815288 | 0.287 | 0.195 | 0.141 |
| 5.092521691468877 | 0.284 | 0.193 | 0.14 |
| 5.095663284122466 | 0.282 | 0.191 | 0.138 |
| 5.098804876776057 | 0.279 | 0.189 | 0.136 |
| 5.101946469429646 | 0.276 | 0.187 | 0.135 |
| 5.105088062083236 | 0.274 | 0.185 | 0.133 |
| 5.108229654736825 | 0.271 | 0.183 | 0.132 |
| 5.111371247390415 | 0.269 | 0.181 | 0.13 |
| 5.114512840044005 | 0.266 | 0.179 | 0.129 |
| 5.117654432697594 | 0.264 | 0.177 | 0.127 |
| 5.120796025351184 | 0.262 | 0.175 | 0.126 |
| 5.123937618004773 | 0.259 | 0.174 | 0.124 |
| 5.127079210658363 | 0.257 | 0.172 | 0.123 |
| 5.130220803311953 | 0.255 | 0.17 | 0.121 |
| 5.133362395965542 | 0.252 | 0.168 | 0.12 |
| 5.136503988619131 | 0.25 | 0.166 | 0.119 |
| 5.13964558127272 | 0.248 | 0.165 | 0.117 |
| 5.142787173926311 | 0.245 | 0.163 | 0.116 |
| 5.1459287665799 | 0.243 | 0.161 | 0.115 |
| 5.14907035923349 | 0.241 | 0.16 | 0.113 |
| 5.15221195188708 | 0.239 | 0.158 | 0.112 |
| 5.15535354454067 | 0.237 | 0.156 | 0.111 |
| 5.158495137194259 | 0.235 | 0.155 | 0.11 |
| 5.161636729847848 | 0.232 | 0.153 | 0.108 |
| 5.164778322501438 | 0.23 | 0.151 | 0.107 |
| 5.167919915155028 | 0.228 | 0.15 | 0.106 |
| 5.171061507808617 | 0.226 | 0.148 | 0.105 |
| 5.174203100462206 | 0.224 | 0.147 | 0.104 |
| 5.177344693115796 | 0.222 | 0.145 | 0.102 |
| 5.180486285769386 | 0.22 | 0.144 | 0.101 |
| 5.183627878422976 | 0.218 | 0.142 | 0.1 |
| 5.186769471076565 | 0.216 | 0.141 | 0.099 |
| 5.189911063730155 | 0.214 | 0.139 | 0.098 |
| 5.193052656383744 | 0.212 | 0.138 | 0.097 |
| 5.196194249037334 | 0.21 | 0.137 | 0.096 |
| 5.199335841690924 | 0.208 | 0.135 | 0.095 |
| 5.202477434344513 | 0.207 | 0.134 | 0.094 |
| 5.205619026998103 | 0.205 | 0.132 | 0.093 |
| 5.208760619651692 | 0.203 | 0.131 | 0.092 |
| 5.211902212305282 | 0.201 | 0.13 | 0.091 |
| 5.215043804958871 | 0.199 | 0.128 | 0.09 |
| 5.218185397612461 | 0.197 | 0.127 | 0.089 |
| 5.221326990266051 | 0.196 | 0.126 | 0.088 |
| 5.22446858291964 | 0.194 | 0.125 | 0.087 |
| 5.22761017557323 | 0.192 | 0.123 | 0.086 |
| 5.23075176822682 | 0.19 | 0.122 | 0.085 |
| 5.23389336088041 | 0.189 | 0.121 | 0.084 |
| 5.237034953533999 | 0.187 | 0.12 | 0.083 |
| 5.240176546187588 | 0.185 | 0.118 | 0.082 |
| 5.243318138841178 | 0.184 | 0.117 | 0.081 |
| 5.246459731494767 | 0.182 | 0.116 | 0.08 |
| 5.249601324148357 | 0.18 | 0.115 | 0.08 |
| 5.252742916801947 | 0.179 | 0.114 | 0.079 |
| 5.255884509455536 | 0.177 | 0.113 | 0.078 |
| 5.259026102109125 | 0.175 | 0.111 | 0.077 |
| 5.262167694762715 | 0.174 | 0.11 | 0.076 |
| 5.265309287416305 | 0.172 | 0.109 | 0.075 |
| 5.268450880069895 | 0.171 | 0.108 | 0.075 |
| 5.271592472723484 | 0.169 | 0.107 | 0.074 |
| 5.274734065377074 | 0.168 | 0.106 | 0.073 |
| 5.277875658030664 | 0.166 | 0.105 | 0.072 |
| 5.281017250684253 | 0.165 | 0.104 | 0.071 |
| 5.284158843337843 | 0.163 | 0.103 | 0.071 |
| 5.287300435991432 | 0.162 | 0.102 | 0.07 |
| 5.290442028645022 | 0.16 | 0.101 | 0.069 |
| 5.293583621298612 | 0.159 | 0.1 | 0.068 |
| 5.296725213952201 | 0.157 | 0.099 | 0.068 |
| 5.299866806605791 | 0.156 | 0.098 | 0.067 |
| 5.30300839925938 | 0.154 | 0.097 | 0.066 |
| 5.30614999191297 | 0.153 | 0.096 | 0.066 |
| 5.30929158456656 | 0.152 | 0.095 | 0.065 |
| 5.312433177220149 | 0.15 | 0.094 | 0.064 |
| 5.315574769873739 | 0.149 | 0.093 | 0.063 |
| 5.318716362527328 | 0.147 | 0.092 | 0.063 |
| 5.321857955180918 | 0.146 | 0.091 | 0.062 |
| 5.324999547834508 | 0.145 | 0.09 | 0.061 |
| 5.328141140488097 | 0.143 | 0.089 | 0.061 |
| 5.331282733141686 | 0.142 | 0.088 | 0.06 |
| 5.334424325795276 | 0.141 | 0.087 | 0.06 |
| 5.337565918448866 | 0.14 | 0.087 | 0.059 |
| 5.340707511102456 | 0.138 | 0.086 | 0.058 |
| 5.343849103756045 | 0.137 | 0.085 | 0.058 |
| 5.346990696409634 | 0.136 | 0.084 | 0.057 |
| 5.350132289063224 | 0.134 | 0.083 | 0.056 |
| 5.353273881716814 | 0.133 | 0.082 | 0.056 |
| 5.356415474370403 | 0.132 | 0.081 | 0.055 |
| 5.359557067023993 | 0.131 | 0.081 | 0.055 |
| 5.362698659677583 | 0.13 | 0.08 | 0.054 |
| 5.365840252331172 | 0.128 | 0.079 | 0.054 |
| 5.368981844984762 | 0.127 | 0.078 | 0.053 |
| 5.372123437638351 | 0.126 | 0.077 | 0.052 |
| 5.375265030291941 | 0.125 | 0.077 | 0.052 |
| 5.378406622945531 | 0.124 | 0.076 | 0.051 |
| 5.38154821559912 | 0.123 | 0.075 | 0.051 |
| 5.38468980825271 | 0.121 | 0.074 | 0.05 |
| 5.387831400906299 | 0.12 | 0.074 | 0.05 |
| 5.39097299355989 | 0.119 | 0.073 | 0.049 |
| 5.394114586213479 | 0.118 | 0.072 | 0.049 |
| 5.397256178867068 | 0.117 | 0.071 | 0.048 |
| 5.400397771520657 | 0.116 | 0.071 | 0.048 |
| 5.403539364174247 | 0.115 | 0.07 | 0.047 |
| 5.406680956827837 | 0.114 | 0.069 | 0.047 |
| 5.409822549481426 | 0.113 | 0.069 | 0.046 |
| 5.412964142135016 | 0.112 | 0.068 | 0.046 |
| 5.416105734788605 | 0.11 | 0.067 | 0.045 |
| 5.419247327442195 | 0.109 | 0.067 | 0.045 |
| 5.422388920095785 | 0.108 | 0.066 | 0.044 |
| 5.425530512749375 | 0.107 | 0.065 | 0.044 |
| 5.428672105402964 | 0.106 | 0.065 | 0.043 |
| 5.431813698056554 | 0.105 | 0.064 | 0.043 |
| 5.434955290710143 | 0.104 | 0.063 | 0.042 |
| 5.438096883363733 | 0.103 | 0.063 | 0.042 |
| 5.441238476017322 | 0.102 | 0.062 | 0.041 |
| 5.444380068670912 | 0.101 | 0.061 | 0.041 |
| 5.447521661324502 | 0.1 | 0.061 | 0.041 |
| 5.450663253978091 | 0.099 | 0.06 | 0.04 |
| 5.453804846631681 | 0.098 | 0.059 | 0.04 |
| 5.456946439285271 | 0.097 | 0.059 | 0.039 |
| 5.46008803193886 | 0.097 | 0.058 | 0.039 |
| 5.46322962459245 | 0.096 | 0.058 | 0.038 |
| 5.466371217246039 | 0.095 | 0.057 | 0.038 |
| 5.46951280989963 | 0.094 | 0.056 | 0.038 |
| 5.472654402553218 | 0.093 | 0.056 | 0.037 |
| 5.475795995206808 | 0.092 | 0.055 | 0.037 |
| 5.478937587860398 | 0.091 | 0.055 | 0.036 |
| 5.482079180513987 | 0.09 | 0.054 | 0.036 |
| 5.485220773167577 | 0.089 | 0.054 | 0.036 |
| 5.488362365821166 | 0.088 | 0.053 | 0.035 |
| 5.491503958474756 | 0.088 | 0.052 | 0.035 |
| 5.494645551128346 | 0.087 | 0.052 | 0.034 |
| 5.497787143781935 | 0.086 | 0.051 | 0.034 |
| 5.500928736435525 | 0.085 | 0.051 | 0.034 |
| 5.504070329089115 | 0.084 | 0.05 | 0.033 |
| 5.507211921742704 | 0.083 | 0.05 | 0.033 |
| 5.510353514396294 | 0.082 | 0.049 | 0.033 |
| 5.513495107049883 | 0.082 | 0.049 | 0.032 |
| 5.516636699703473 | 0.081 | 0.048 | 0.032 |
| 5.519778292357062 | 0.08 | 0.048 | 0.032 |
| 5.522919885010652 | 0.079 | 0.047 | 0.031 |
| 5.526061477664242 | 0.078 | 0.047 | 0.031 |
| 5.529203070317831 | 0.078 | 0.046 | 0.031 |
| 5.532344662971421 | 0.077 | 0.046 | 0.03 |
| 5.535486255625011 | 0.076 | 0.045 | 0.03 |
| 5.5386278482786 | 0.075 | 0.045 | 0.03 |
| 5.54176944093219 | 0.074 | 0.044 | 0.029 |
| 5.544911033585779 | 0.074 | 0.044 | 0.029 |
| 5.54805262623937 | 0.073 | 0.043 | 0.029 |
| 5.551194218892959 | 0.072 | 0.043 | 0.028 |
| 5.554335811546548 | 0.071 | 0.042 | 0.028 |
| 5.557477404200137 | 0.071 | 0.042 | 0.028 |
| 5.560618996853727 | 0.07 | 0.041 | 0.027 |
| 5.563760589507317 | 0.069 | 0.041 | 0.027 |
| 5.566902182160906 | 0.069 | 0.04 | 0.027 |
| 5.570043774814496 | 0.068 | 0.04 | 0.026 |
| 5.573185367468086 | 0.067 | 0.04 | 0.026 |
| 5.576326960121675 | 0.066 | 0.039 | 0.026 |
| 5.579468552775264 | 0.066 | 0.039 | 0.026 |
| 5.582610145428854 | 0.065 | 0.038 | 0.025 |
| 5.585751738082444 | 0.064 | 0.038 | 0.025 |
| 5.588893330736034 | 0.064 | 0.037 | 0.025 |
| 5.592034923389623 | 0.063 | 0.037 | 0.024 |
| 5.595176516043213 | 0.062 | 0.037 | 0.024 |
| 5.598318108696803 | 0.062 | 0.036 | 0.024 |
| 5.601459701350392 | 0.061 | 0.036 | 0.024 |
| 5.604601294003982 | 0.06 | 0.035 | 0.023 |
| 5.607742886657571 | 0.06 | 0.035 | 0.023 |
| 5.610884479311161 | 0.059 | 0.035 | 0.023 |
| 5.61402607196475 | 0.058 | 0.034 | 0.022 |
| 5.61716766461834 | 0.058 | 0.034 | 0.022 |
| 5.62030925727193 | 0.057 | 0.033 | 0.022 |
| 5.623450849925519 | 0.056 | 0.033 | 0.022 |
| 5.626592442579109 | 0.056 | 0.033 | 0.021 |
| 5.629734035232698 | 0.055 | 0.032 | 0.021 |
| 5.632875627886288 | 0.055 | 0.032 | 0.021 |
| 5.636017220539878 | 0.054 | 0.032 | 0.021 |
| 5.639158813193467 | 0.053 | 0.031 | 0.02 |
| 5.642300405847057 | 0.053 | 0.031 | 0.02 |
| 5.645441998500646 | 0.052 | 0.03 | 0.02 |
| 5.648583591154236 | 0.052 | 0.03 | 0.02 |
| 5.651725183807825 | 0.051 | 0.03 | 0.019 |
| 5.654866776461415 | 0.05 | 0.029 | 0.019 |
| 5.658008369115005 | 0.05 | 0.029 | 0.019 |
| 5.661149961768594 | 0.049 | 0.029 | 0.019 |
| 5.664291554422184 | 0.049 | 0.028 | 0.019 |
| 5.667433147075774 | 0.048 | 0.028 | 0.018 |
| 5.670574739729363 | 0.048 | 0.028 | 0.018 |
| 5.673716332382953 | 0.047 | 0.027 | 0.018 |
| 5.676857925036542 | 0.046 | 0.027 | 0.018 |
| 5.679999517690132 | 0.046 | 0.027 | 0.017 |
| 5.683141110343721 | 0.045 | 0.026 | 0.017 |
| 5.686282702997311 | 0.045 | 0.026 | 0.017 |
| 5.689424295650901 | 0.044 | 0.026 | 0.017 |
| 5.69256588830449 | 0.044 | 0.025 | 0.017 |
| 5.69570748095808 | 0.043 | 0.025 | 0.016 |
| 5.69884907361167 | 0.043 | 0.025 | 0.016 |
| 5.701990666265259 | 0.042 | 0.025 | 0.016 |
| 5.705132258918849 | 0.042 | 0.024 | 0.016 |
| 5.708273851572438 | 0.041 | 0.024 | 0.016 |
| 5.711415444226028 | 0.041 | 0.024 | 0.015 |
| 5.714557036879618 | 0.04 | 0.023 | 0.015 |
| 5.717698629533207 | 0.04 | 0.023 | 0.015 |
| 5.720840222186797 | 0.039 | 0.023 | 0.015 |
| 5.723981814840386 | 0.039 | 0.022 | 0.015 |
| 5.727123407493976 | 0.038 | 0.022 | 0.014 |
| 5.730265000147565 | 0.038 | 0.022 | 0.014 |
| 5.733406592801155 | 0.037 | 0.022 | 0.014 |
| 5.736548185454744 | 0.037 | 0.021 | 0.014 |
| 5.739689778108334 | 0.036 | 0.021 | 0.014 |
| 5.742831370761924 | 0.036 | 0.021 | 0.013 |
| 5.745972963415514 | 0.035 | 0.02 | 0.013 |
| 5.749114556069103 | 0.035 | 0.02 | 0.013 |
| 5.752256148722693 | 0.035 | 0.02 | 0.013 |
| 5.755397741376282 | 0.034 | 0.02 | 0.013 |
| 5.758539334029872 | 0.034 | 0.019 | 0.013 |
| 5.761680926683462 | 0.033 | 0.019 | 0.012 |
| 5.764822519337051 | 0.033 | 0.019 | 0.012 |
| 5.767964111990641 | 0.032 | 0.019 | 0.012 |
| 5.77110570464423 | 0.032 | 0.018 | 0.012 |
| 5.77424729729782 | 0.031 | 0.018 | 0.012 |
| 5.77738888995141 | 0.031 | 0.018 | 0.012 |
| 5.780530482605 | 0.031 | 0.018 | 0.011 |
| 5.783672075258588 | 0.03 | 0.017 | 0.011 |
| 5.786813667912178 | 0.03 | 0.017 | 0.011 |
| 5.789955260565768 | 0.029 | 0.017 | 0.011 |
| 5.793096853219358 | 0.029 | 0.017 | 0.011 |
| 5.796238445872947 | 0.029 | 0.016 | 0.011 |
| 5.799380038526537 | 0.028 | 0.016 | 0.01 |
| 5.802521631180126 | 0.028 | 0.016 | 0.01 |
| 5.805663223833715 | 0.027 | 0.016 | 0.01 |
| 5.808804816487306 | 0.027 | 0.016 | 0.01 |
| 5.811946409140895 | 0.027 | 0.015 | 0.01 |
| 5.815088001794485 | 0.026 | 0.015 | 0.01 |
| 5.818229594448074 | 0.026 | 0.015 | 0.01 |
| 5.821371187101663 | 0.025 | 0.015 | 0.009 |
| 5.824512779755254 | 0.025 | 0.014 | 0.009 |
| 5.827654372408843 | 0.025 | 0.014 | 0.009 |
| 5.830795965062433 | 0.024 | 0.014 | 0.009 |
| 5.833937557716022 | 0.024 | 0.014 | 0.009 |
| 5.837079150369612 | 0.024 | 0.014 | 0.009 |
| 5.840220743023201 | 0.023 | 0.013 | 0.009 |
| 5.843362335676791 | 0.023 | 0.013 | 0.008 |
| 5.846503928330381 | 0.023 | 0.013 | 0.008 |
| 5.84964552098397 | 0.022 | 0.013 | 0.008 |
| 5.85278711363756 | 0.022 | 0.013 | 0.008 |
| 5.85592870629115 | 0.022 | 0.012 | 0.008 |
| 5.85907029894474 | 0.021 | 0.012 | 0.008 |
| 5.862211891598329 | 0.021 | 0.012 | 0.008 |
| 5.865353484251918 | 0.021 | 0.012 | 0.008 |
| 5.868495076905508 | 0.02 | 0.012 | 0.007 |
| 5.871636669559098 | 0.02 | 0.011 | 0.007 |
| 5.874778262212687 | 0.02 | 0.011 | 0.007 |
| 5.877919854866277 | 0.019 | 0.011 | 0.007 |
| 5.881061447519866 | 0.019 | 0.011 | 0.007 |
| 5.884203040173456 | 0.019 | 0.011 | 0.007 |
| 5.887344632827046 | 0.018 | 0.01 | 0.007 |
| 5.890486225480635 | 0.018 | 0.01 | 0.007 |
| 5.893627818134224 | 0.018 | 0.01 | 0.007 |
| 5.896769410787814 | 0.017 | 0.01 | 0.006 |
| 5.899911003441404 | 0.017 | 0.01 | 0.006 |
| 5.903052596094994 | 0.017 | 0.01 | 0.006 |
| 5.906194188748583 | 0.017 | 0.009 | 0.006 |
| 5.909335781402172 | 0.016 | 0.009 | 0.006 |
| 5.912477374055762 | 0.016 | 0.009 | 0.006 |
| 5.915618966709352 | 0.016 | 0.009 | 0.006 |
| 5.918760559362942 | 0.015 | 0.009 | 0.006 |
| 5.921902152016531 | 0.015 | 0.009 | 0.006 |
| 5.92504374467012 | 0.015 | 0.008 | 0.005 |
| 5.92818533732371 | 0.015 | 0.008 | 0.005 |
| 5.9313269299773 | 0.014 | 0.008 | 0.005 |
| 5.93446852263089 | 0.014 | 0.008 | 0.005 |
| 5.93761011528448 | 0.014 | 0.008 | 0.005 |
| 5.940751707938068 | 0.014 | 0.008 | 0.005 |
| 5.943893300591658 | 0.013 | 0.008 | 0.005 |
| 5.947034893245248 | 0.013 | 0.007 | 0.005 |
| 5.950176485898837 | 0.013 | 0.007 | 0.005 |
| 5.953318078552427 | 0.013 | 0.007 | 0.005 |
| 5.956459671206017 | 0.012 | 0.007 | 0.004 |
| 5.959601263859606 | 0.012 | 0.007 | 0.004 |
| 5.962742856513196 | 0.012 | 0.007 | 0.004 |
| 5.965884449166785 | 0.012 | 0.007 | 0.004 |
| 5.969026041820375 | 0.011 | 0.006 | 0.004 |
| 5.972167634473964 | 0.011 | 0.006 | 0.004 |
| 5.975309227127554 | 0.011 | 0.006 | 0.004 |
| 5.978450819781144 | 0.011 | 0.006 | 0.004 |
| 5.981592412434733 | 0.01 | 0.006 | 0.004 |
| 5.984734005088323 | 0.01 | 0.006 | 0.004 |
| 5.987875597741913 | 0.01 | 0.006 | 0.004 |
| 5.991017190395502 | 0.01 | 0.006 | 0.004 |
| 5.994158783049092 | 0.01 | 0.005 | 0.003 |
| 5.997300375702681 | 0.009 | 0.005 | 0.003 |
| 6.000441968356271 | 0.009 | 0.005 | 0.003 |
| 6.003583561009861 | 0.009 | 0.005 | 0.003 |
| 6.00672515366345 | 0.009 | 0.005 | 0.003 |
| 6.00986674631704 | 0.009 | 0.005 | 0.003 |
| 6.01300833897063 | 0.008 | 0.005 | 0.003 |
| 6.01614993162422 | 0.008 | 0.005 | 0.003 |
| 6.019291524277808 | 0.008 | 0.004 | 0.003 |
| 6.022433116931398 | 0.008 | 0.004 | 0.003 |
| 6.025574709584988 | 0.008 | 0.004 | 0.003 |
| 6.028716302238577 | 0.007 | 0.004 | 0.003 |
| 6.031857894892167 | 0.007 | 0.004 | 0.003 |
| 6.034999487545757 | 0.007 | 0.004 | 0.003 |
| 6.038141080199346 | 0.007 | 0.004 | 0.002 |
| 6.041282672852935 | 0.007 | 0.004 | 0.002 |
| 6.044424265506525 | 0.006 | 0.004 | 0.002 |
| 6.047565858160115 | 0.006 | 0.004 | 0.002 |
| 6.050707450813704 | 0.006 | 0.003 | 0.002 |
| 6.053849043467294 | 0.006 | 0.003 | 0.002 |
| 6.056990636120884 | 0.006 | 0.003 | 0.002 |
| 6.060132228774473 | 0.006 | 0.003 | 0.002 |
| 6.063273821428063 | 0.005 | 0.003 | 0.002 |
| 6.066415414081653 | 0.005 | 0.003 | 0.002 |
| 6.069557006735242 | 0.005 | 0.003 | 0.002 |
| 6.072698599388831 | 0.005 | 0.003 | 0.002 |
| 6.07584019204242 | 0.005 | 0.003 | 0.002 |
| 6.078981784696011 | 0.005 | 0.003 | 0.002 |
| 6.082123377349601 | 0.005 | 0.003 | 0.002 |
| 6.08526497000319 | 0.004 | 0.002 | 0.002 |
| 6.08840656265678 | 0.004 | 0.002 | 0.002 |
| 6.09154815531037 | 0.004 | 0.002 | 0.001 |
| 6.094689747963959 | 0.004 | 0.002 | 0.001 |
| 6.097831340617549 | 0.004 | 0.002 | 0.001 |
| 6.100972933271138 | 0.004 | 0.002 | 0.001 |
| 6.104114525924728 | 0.004 | 0.002 | 0.001 |
| 6.107256118578317 | 0.003 | 0.002 | 0.001 |
| 6.110397711231907 | 0.003 | 0.002 | 0.001 |
| 6.113539303885497 | 0.003 | 0.002 | 0.001 |
| 6.116680896539086 | 0.003 | 0.002 | 0.001 |
| 6.119822489192675 | 0.003 | 0.002 | 0.001 |
| 6.122964081846265 | 0.003 | 0.002 | 0.001 |
| 6.126105674499855 | 0.003 | 0.002 | 0.001 |
| 6.129247267153445 | 0.003 | 0.001 | 0.001 |
| 6.132388859807034 | 0.003 | 0.001 | 0.001 |
| 6.135530452460624 | 0.002 | 0.001 | 0.001 |
| 6.138672045114213 | 0.002 | 0.001 | 0.001 |
| 6.141813637767803 | 0.002 | 0.001 | 0.001 |
| 6.144955230421393 | 0.002 | 0.001 | 0.001 |
| 6.148096823074982 | 0.002 | 0.001 | 0.001 |
| 6.151238415728571 | 0.002 | 0.001 | 0.001 |
| 6.154380008382161 | 0.002 | 0.001 | 0.001 |
| 6.157521601035751 | 0.002 | 0.001 | 0.001 |
| 6.16066319368934 | 0.002 | 0.001 | 0.001 |
| 6.16380478634293 | 0.002 | 0.001 | 0.001 |
| 6.16694637899652 | 0.002 | 0.001 | 0.001 |
| 6.170087971650109 | 0.001 | 0.001 | 0.001 |
| 6.173229564303698 | 0.001 | 0.001 | 0 |
| 6.176371156957289 | 0.001 | 0.001 | 0 |
| 6.179512749610878 | 0.001 | 0.001 | 0 |
| 6.182654342264468 | 0.001 | 0.001 | 0 |
| 6.185795934918057 | 0.001 | 0.001 | 0 |
| 6.188937527571647 | 0.001 | 0.001 | 0 |
| 6.192079120225237 | 0.001 | 0.001 | 0 |
| 6.195220712878826 | 0.001 | 0 | 0 |
| 6.198362305532415 | 0.001 | 0 | 0 |
| 6.201503898186005 | 0.001 | 0 | 0 |
| 6.204645490839594 | 0.001 | 0 | 0 |
| 6.207787083493184 | 0.001 | 0 | 0 |
| 6.210928676146774 | 0.001 | 0 | 0 |
| 6.214070268800364 | 0.001 | 0 | 0 |
| 6.217211861453953 | 0 | 0 | 0 |
| 6.220353454107543 | 0 | 0 | 0 |
| 6.223495046761133 | 0 | 0 | 0 |
| 6.226636639414722 | 0 | 0 | 0 |
| 6.229778232068312 | 0 | 0 | 0 |
| 6.232919824721901 | 0 | 0 | 0 |
| 6.236061417375491 | 0 | 0 | 0 |
| 6.23920301002908 | 0 | 0 | 0 |
| 6.24234460268267 | 0 | 0 | 0 |
| 6.24548619533626 | 0 | 0 | 0 |
| 6.24862778798985 | 0 | 0 | 0 |
| 6.251769380643438 | 0 | 0 | 0 |
| 6.254910973297028 | 0 | 0 | 0 |
| 6.258052565950618 | 0 | 0 | 0 |
| 6.261194158604208 | 0 | 0 | 0 |
| 6.264335751257797 | 0 | 0 | 0 |
| 6.267477343911387 | 0 | 0 | 0 |
| 6.270618936564976 | 0 | 0 | 0 |
| 6.273760529218566 | 0 | 0 | 0 |
| 6.276902121872155 | 0 | 0 | 0 |
| 6.280043714525745 | 0 | 0 | 0 |
| 6.283185307179335 | 0 | 0 | 0 |